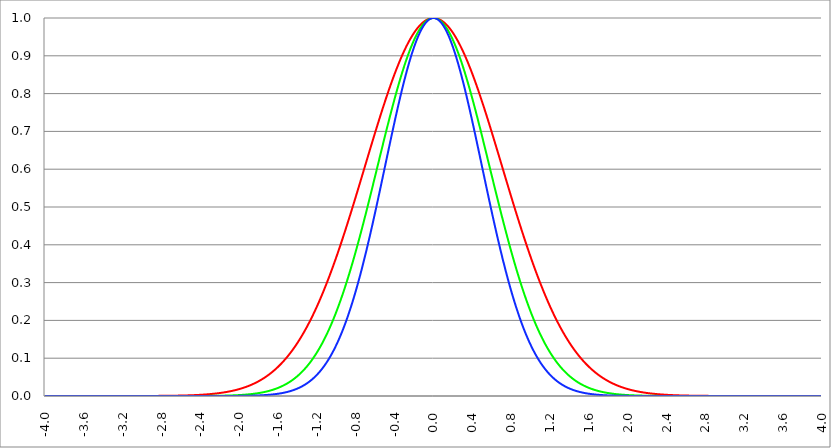
| Category | Series 1 | Series 0 | Series 2 |
|---|---|---|---|
| -4.0 | 0 | 0 | 0 |
| -3.996 | 0 | 0 | 0 |
| -3.992 | 0 | 0 | 0 |
| -3.988 | 0 | 0 | 0 |
| -3.984 | 0 | 0 | 0 |
| -3.98 | 0 | 0 | 0 |
| -3.976 | 0 | 0 | 0 |
| -3.972 | 0 | 0 | 0 |
| -3.968 | 0 | 0 | 0 |
| -3.964 | 0 | 0 | 0 |
| -3.96 | 0 | 0 | 0 |
| -3.956 | 0 | 0 | 0 |
| -3.952 | 0 | 0 | 0 |
| -3.948 | 0 | 0 | 0 |
| -3.944 | 0 | 0 | 0 |
| -3.94 | 0 | 0 | 0 |
| -3.936 | 0 | 0 | 0 |
| -3.932 | 0 | 0 | 0 |
| -3.928 | 0 | 0 | 0 |
| -3.924 | 0 | 0 | 0 |
| -3.92 | 0 | 0 | 0 |
| -3.916 | 0 | 0 | 0 |
| -3.912 | 0 | 0 | 0 |
| -3.908 | 0 | 0 | 0 |
| -3.904 | 0 | 0 | 0 |
| -3.9 | 0 | 0 | 0 |
| -3.896 | 0 | 0 | 0 |
| -3.892 | 0 | 0 | 0 |
| -3.888 | 0 | 0 | 0 |
| -3.884 | 0 | 0 | 0 |
| -3.88 | 0 | 0 | 0 |
| -3.876 | 0 | 0 | 0 |
| -3.872 | 0 | 0 | 0 |
| -3.868 | 0 | 0 | 0 |
| -3.864 | 0 | 0 | 0 |
| -3.86 | 0 | 0 | 0 |
| -3.856 | 0 | 0 | 0 |
| -3.852 | 0 | 0 | 0 |
| -3.848 | 0 | 0 | 0 |
| -3.844 | 0 | 0 | 0 |
| -3.84 | 0 | 0 | 0 |
| -3.836 | 0 | 0 | 0 |
| -3.832 | 0 | 0 | 0 |
| -3.828 | 0 | 0 | 0 |
| -3.824 | 0 | 0 | 0 |
| -3.82 | 0 | 0 | 0 |
| -3.816 | 0 | 0 | 0 |
| -3.812 | 0 | 0 | 0 |
| -3.808 | 0 | 0 | 0 |
| -3.804 | 0 | 0 | 0 |
| -3.8 | 0 | 0 | 0 |
| -3.796 | 0 | 0 | 0 |
| -3.792 | 0 | 0 | 0 |
| -3.788 | 0 | 0 | 0 |
| -3.784 | 0 | 0 | 0 |
| -3.78 | 0 | 0 | 0 |
| -3.776 | 0 | 0 | 0 |
| -3.772 | 0 | 0 | 0 |
| -3.768 | 0 | 0 | 0 |
| -3.764 | 0 | 0 | 0 |
| -3.76 | 0 | 0 | 0 |
| -3.756 | 0 | 0 | 0 |
| -3.752 | 0 | 0 | 0 |
| -3.748 | 0 | 0 | 0 |
| -3.744 | 0 | 0 | 0 |
| -3.74 | 0 | 0 | 0 |
| -3.736 | 0 | 0 | 0 |
| -3.732 | 0 | 0 | 0 |
| -3.728 | 0 | 0 | 0 |
| -3.724 | 0 | 0 | 0 |
| -3.72 | 0 | 0 | 0 |
| -3.716 | 0 | 0 | 0 |
| -3.712 | 0 | 0 | 0 |
| -3.708 | 0 | 0 | 0 |
| -3.704 | 0 | 0 | 0 |
| -3.7 | 0 | 0 | 0 |
| -3.696 | 0 | 0 | 0 |
| -3.692 | 0 | 0 | 0 |
| -3.688 | 0 | 0 | 0 |
| -3.684 | 0 | 0 | 0 |
| -3.68 | 0 | 0 | 0 |
| -3.676 | 0 | 0 | 0 |
| -3.672 | 0 | 0 | 0 |
| -3.668 | 0 | 0 | 0 |
| -3.664 | 0 | 0 | 0 |
| -3.66 | 0 | 0 | 0 |
| -3.656 | 0 | 0 | 0 |
| -3.652 | 0 | 0 | 0 |
| -3.648 | 0 | 0 | 0 |
| -3.644 | 0 | 0 | 0 |
| -3.64 | 0 | 0 | 0 |
| -3.636 | 0 | 0 | 0 |
| -3.632 | 0 | 0 | 0 |
| -3.628 | 0 | 0 | 0 |
| -3.624 | 0 | 0 | 0 |
| -3.62 | 0 | 0 | 0 |
| -3.616 | 0 | 0 | 0 |
| -3.612 | 0 | 0 | 0 |
| -3.608 | 0 | 0 | 0 |
| -3.604 | 0 | 0 | 0 |
| -3.6 | 0 | 0 | 0 |
| -3.596 | 0 | 0 | 0 |
| -3.592 | 0 | 0 | 0 |
| -3.588 | 0 | 0 | 0 |
| -3.584 | 0 | 0 | 0 |
| -3.58 | 0 | 0 | 0 |
| -3.576 | 0 | 0 | 0 |
| -3.572 | 0 | 0 | 0 |
| -3.568 | 0 | 0 | 0 |
| -3.564 | 0 | 0 | 0 |
| -3.56 | 0 | 0 | 0 |
| -3.556 | 0 | 0 | 0 |
| -3.552 | 0 | 0 | 0 |
| -3.548 | 0 | 0 | 0 |
| -3.544 | 0 | 0 | 0 |
| -3.54 | 0 | 0 | 0 |
| -3.536 | 0 | 0 | 0 |
| -3.532 | 0 | 0 | 0 |
| -3.528 | 0 | 0 | 0 |
| -3.524 | 0 | 0 | 0 |
| -3.52 | 0 | 0 | 0 |
| -3.516 | 0 | 0 | 0 |
| -3.512 | 0 | 0 | 0 |
| -3.508 | 0 | 0 | 0 |
| -3.504 | 0 | 0 | 0 |
| -3.5 | 0 | 0 | 0 |
| -3.496 | 0 | 0 | 0 |
| -3.492 | 0 | 0 | 0 |
| -3.488 | 0 | 0 | 0 |
| -3.484 | 0 | 0 | 0 |
| -3.48 | 0 | 0 | 0 |
| -3.476 | 0 | 0 | 0 |
| -3.472 | 0 | 0 | 0 |
| -3.467999999999999 | 0 | 0 | 0 |
| -3.463999999999999 | 0 | 0 | 0 |
| -3.459999999999999 | 0 | 0 | 0 |
| -3.455999999999999 | 0 | 0 | 0 |
| -3.451999999999999 | 0 | 0 | 0 |
| -3.447999999999999 | 0 | 0 | 0 |
| -3.443999999999999 | 0 | 0 | 0 |
| -3.439999999999999 | 0 | 0 | 0 |
| -3.435999999999999 | 0 | 0 | 0 |
| -3.431999999999999 | 0 | 0 | 0 |
| -3.427999999999999 | 0 | 0 | 0 |
| -3.423999999999999 | 0 | 0 | 0 |
| -3.419999999999999 | 0 | 0 | 0 |
| -3.415999999999999 | 0 | 0 | 0 |
| -3.411999999999999 | 0 | 0 | 0 |
| -3.407999999999999 | 0 | 0 | 0 |
| -3.403999999999999 | 0 | 0 | 0 |
| -3.399999999999999 | 0 | 0 | 0 |
| -3.395999999999999 | 0 | 0 | 0 |
| -3.391999999999999 | 0 | 0 | 0 |
| -3.387999999999999 | 0 | 0 | 0 |
| -3.383999999999999 | 0 | 0 | 0 |
| -3.379999999999999 | 0 | 0 | 0 |
| -3.375999999999999 | 0 | 0 | 0 |
| -3.371999999999999 | 0 | 0 | 0 |
| -3.367999999999999 | 0 | 0 | 0 |
| -3.363999999999999 | 0 | 0 | 0 |
| -3.359999999999999 | 0 | 0 | 0 |
| -3.355999999999999 | 0 | 0 | 0 |
| -3.351999999999999 | 0 | 0 | 0 |
| -3.347999999999999 | 0 | 0 | 0 |
| -3.343999999999999 | 0 | 0 | 0 |
| -3.339999999999999 | 0 | 0 | 0 |
| -3.335999999999999 | 0 | 0 | 0 |
| -3.331999999999999 | 0 | 0 | 0 |
| -3.327999999999999 | 0 | 0 | 0 |
| -3.323999999999999 | 0 | 0 | 0 |
| -3.319999999999999 | 0 | 0 | 0 |
| -3.315999999999999 | 0 | 0 | 0 |
| -3.311999999999999 | 0 | 0 | 0 |
| -3.307999999999999 | 0 | 0 | 0 |
| -3.303999999999999 | 0 | 0 | 0 |
| -3.299999999999999 | 0 | 0 | 0 |
| -3.295999999999999 | 0 | 0 | 0 |
| -3.291999999999999 | 0 | 0 | 0 |
| -3.288 | 0 | 0 | 0 |
| -3.284 | 0 | 0 | 0 |
| -3.279999999999999 | 0 | 0 | 0 |
| -3.275999999999999 | 0 | 0 | 0 |
| -3.271999999999999 | 0 | 0 | 0 |
| -3.268 | 0 | 0 | 0 |
| -3.264 | 0 | 0 | 0 |
| -3.259999999999999 | 0 | 0 | 0 |
| -3.255999999999999 | 0 | 0 | 0 |
| -3.251999999999999 | 0 | 0 | 0 |
| -3.248 | 0 | 0 | 0 |
| -3.244 | 0 | 0 | 0 |
| -3.239999999999999 | 0 | 0 | 0 |
| -3.235999999999999 | 0 | 0 | 0 |
| -3.231999999999999 | 0 | 0 | 0 |
| -3.228 | 0 | 0 | 0 |
| -3.224 | 0 | 0 | 0 |
| -3.219999999999999 | 0 | 0 | 0 |
| -3.215999999999999 | 0 | 0 | 0 |
| -3.211999999999999 | 0 | 0 | 0 |
| -3.208 | 0 | 0 | 0 |
| -3.204 | 0 | 0 | 0 |
| -3.199999999999999 | 0 | 0 | 0 |
| -3.195999999999999 | 0 | 0 | 0 |
| -3.191999999999999 | 0 | 0 | 0 |
| -3.188 | 0 | 0 | 0 |
| -3.184 | 0 | 0 | 0 |
| -3.179999999999999 | 0 | 0 | 0 |
| -3.175999999999999 | 0 | 0 | 0 |
| -3.171999999999999 | 0 | 0 | 0 |
| -3.168 | 0 | 0 | 0 |
| -3.164 | 0 | 0 | 0 |
| -3.159999999999999 | 0 | 0 | 0 |
| -3.155999999999999 | 0 | 0 | 0 |
| -3.151999999999999 | 0 | 0 | 0 |
| -3.148 | 0 | 0 | 0 |
| -3.144 | 0 | 0 | 0 |
| -3.139999999999999 | 0 | 0 | 0 |
| -3.135999999999999 | 0 | 0 | 0 |
| -3.131999999999999 | 0 | 0 | 0 |
| -3.128 | 0 | 0 | 0 |
| -3.124 | 0 | 0 | 0 |
| -3.119999999999999 | 0 | 0 | 0 |
| -3.115999999999999 | 0 | 0 | 0 |
| -3.111999999999999 | 0 | 0 | 0 |
| -3.108 | 0 | 0 | 0 |
| -3.104 | 0 | 0 | 0 |
| -3.099999999999999 | 0 | 0 | 0 |
| -3.095999999999999 | 0 | 0 | 0 |
| -3.091999999999999 | 0 | 0 | 0 |
| -3.088 | 0 | 0 | 0 |
| -3.084 | 0 | 0 | 0 |
| -3.079999999999999 | 0 | 0 | 0 |
| -3.075999999999999 | 0 | 0 | 0 |
| -3.071999999999999 | 0 | 0 | 0 |
| -3.068 | 0 | 0 | 0 |
| -3.064 | 0 | 0 | 0 |
| -3.059999999999999 | 0 | 0 | 0 |
| -3.055999999999999 | 0 | 0 | 0 |
| -3.051999999999999 | 0 | 0 | 0 |
| -3.048 | 0 | 0 | 0 |
| -3.044 | 0 | 0 | 0 |
| -3.039999999999999 | 0 | 0 | 0 |
| -3.035999999999999 | 0 | 0 | 0 |
| -3.031999999999999 | 0 | 0 | 0 |
| -3.028 | 0 | 0 | 0 |
| -3.024 | 0 | 0 | 0 |
| -3.019999999999999 | 0 | 0 | 0 |
| -3.015999999999999 | 0 | 0 | 0 |
| -3.011999999999999 | 0 | 0 | 0 |
| -3.008 | 0 | 0 | 0 |
| -3.004 | 0 | 0 | 0 |
| -2.999999999999999 | 0 | 0 | 0 |
| -2.995999999999999 | 0 | 0 | 0 |
| -2.991999999999999 | 0 | 0 | 0 |
| -2.988 | 0 | 0 | 0 |
| -2.984 | 0 | 0 | 0 |
| -2.979999999999999 | 0 | 0 | 0 |
| -2.975999999999999 | 0 | 0 | 0 |
| -2.971999999999999 | 0 | 0 | 0 |
| -2.968 | 0 | 0 | 0 |
| -2.964 | 0 | 0 | 0 |
| -2.959999999999999 | 0 | 0 | 0 |
| -2.955999999999999 | 0 | 0 | 0 |
| -2.951999999999999 | 0 | 0 | 0 |
| -2.948 | 0 | 0 | 0 |
| -2.944 | 0 | 0 | 0 |
| -2.939999999999999 | 0 | 0 | 0 |
| -2.935999999999999 | 0 | 0 | 0 |
| -2.931999999999999 | 0 | 0 | 0 |
| -2.928 | 0 | 0 | 0 |
| -2.924 | 0 | 0 | 0 |
| -2.919999999999999 | 0 | 0 | 0 |
| -2.915999999999999 | 0 | 0 | 0 |
| -2.911999999999999 | 0 | 0 | 0 |
| -2.908 | 0 | 0 | 0 |
| -2.904 | 0 | 0 | 0 |
| -2.899999999999999 | 0 | 0 | 0 |
| -2.895999999999999 | 0 | 0 | 0 |
| -2.891999999999999 | 0 | 0 | 0 |
| -2.887999999999999 | 0 | 0 | 0 |
| -2.883999999999999 | 0 | 0 | 0 |
| -2.879999999999999 | 0 | 0 | 0 |
| -2.875999999999999 | 0 | 0 | 0 |
| -2.871999999999999 | 0 | 0 | 0 |
| -2.867999999999999 | 0 | 0 | 0 |
| -2.863999999999999 | 0 | 0 | 0 |
| -2.859999999999999 | 0 | 0 | 0 |
| -2.855999999999999 | 0 | 0 | 0 |
| -2.851999999999999 | 0 | 0 | 0 |
| -2.847999999999999 | 0 | 0 | 0 |
| -2.843999999999999 | 0 | 0 | 0 |
| -2.839999999999999 | 0 | 0 | 0 |
| -2.835999999999999 | 0 | 0 | 0 |
| -2.831999999999999 | 0 | 0 | 0 |
| -2.827999999999999 | 0 | 0 | 0 |
| -2.823999999999999 | 0 | 0 | 0 |
| -2.819999999999999 | 0 | 0 | 0 |
| -2.815999999999999 | 0 | 0 | 0 |
| -2.811999999999999 | 0 | 0 | 0 |
| -2.807999999999999 | 0 | 0 | 0 |
| -2.803999999999999 | 0 | 0 | 0 |
| -2.799999999999999 | 0 | 0 | 0 |
| -2.795999999999999 | 0 | 0 | 0 |
| -2.791999999999999 | 0 | 0 | 0 |
| -2.787999999999999 | 0 | 0 | 0 |
| -2.783999999999999 | 0 | 0 | 0 |
| -2.779999999999999 | 0 | 0 | 0 |
| -2.775999999999999 | 0 | 0 | 0 |
| -2.771999999999999 | 0 | 0 | 0 |
| -2.767999999999999 | 0 | 0 | 0 |
| -2.763999999999999 | 0 | 0 | 0 |
| -2.759999999999999 | 0 | 0 | 0 |
| -2.755999999999999 | 0.001 | 0 | 0 |
| -2.751999999999999 | 0.001 | 0 | 0 |
| -2.747999999999999 | 0.001 | 0 | 0 |
| -2.743999999999999 | 0.001 | 0 | 0 |
| -2.739999999999999 | 0.001 | 0 | 0 |
| -2.735999999999999 | 0.001 | 0 | 0 |
| -2.731999999999999 | 0.001 | 0 | 0 |
| -2.727999999999999 | 0.001 | 0 | 0 |
| -2.723999999999999 | 0.001 | 0 | 0 |
| -2.719999999999999 | 0.001 | 0 | 0 |
| -2.715999999999999 | 0.001 | 0 | 0 |
| -2.711999999999999 | 0.001 | 0 | 0 |
| -2.707999999999999 | 0.001 | 0 | 0 |
| -2.703999999999999 | 0.001 | 0 | 0 |
| -2.699999999999999 | 0.001 | 0 | 0 |
| -2.695999999999999 | 0.001 | 0 | 0 |
| -2.691999999999999 | 0.001 | 0 | 0 |
| -2.687999999999999 | 0.001 | 0 | 0 |
| -2.683999999999999 | 0.001 | 0 | 0 |
| -2.679999999999999 | 0.001 | 0 | 0 |
| -2.675999999999999 | 0.001 | 0 | 0 |
| -2.671999999999999 | 0.001 | 0 | 0 |
| -2.667999999999999 | 0.001 | 0 | 0 |
| -2.663999999999999 | 0.001 | 0 | 0 |
| -2.659999999999999 | 0.001 | 0 | 0 |
| -2.655999999999999 | 0.001 | 0 | 0 |
| -2.651999999999999 | 0.001 | 0 | 0 |
| -2.647999999999999 | 0.001 | 0 | 0 |
| -2.643999999999999 | 0.001 | 0 | 0 |
| -2.639999999999999 | 0.001 | 0 | 0 |
| -2.635999999999999 | 0.001 | 0 | 0 |
| -2.631999999999999 | 0.001 | 0 | 0 |
| -2.627999999999999 | 0.001 | 0 | 0 |
| -2.623999999999999 | 0.001 | 0 | 0 |
| -2.619999999999999 | 0.001 | 0 | 0 |
| -2.615999999999999 | 0.001 | 0 | 0 |
| -2.611999999999999 | 0.001 | 0 | 0 |
| -2.607999999999999 | 0.001 | 0 | 0 |
| -2.603999999999999 | 0.001 | 0 | 0 |
| -2.599999999999999 | 0.001 | 0 | 0 |
| -2.595999999999999 | 0.001 | 0 | 0 |
| -2.591999999999999 | 0.001 | 0 | 0 |
| -2.587999999999999 | 0.001 | 0 | 0 |
| -2.583999999999999 | 0.001 | 0 | 0 |
| -2.579999999999999 | 0.001 | 0 | 0 |
| -2.575999999999999 | 0.001 | 0 | 0 |
| -2.571999999999999 | 0.001 | 0 | 0 |
| -2.567999999999999 | 0.001 | 0 | 0 |
| -2.563999999999999 | 0.001 | 0 | 0 |
| -2.559999999999999 | 0.001 | 0 | 0 |
| -2.555999999999999 | 0.001 | 0 | 0 |
| -2.551999999999999 | 0.001 | 0 | 0 |
| -2.547999999999999 | 0.002 | 0 | 0 |
| -2.543999999999999 | 0.002 | 0 | 0 |
| -2.539999999999999 | 0.002 | 0 | 0 |
| -2.535999999999999 | 0.002 | 0 | 0 |
| -2.531999999999999 | 0.002 | 0 | 0 |
| -2.527999999999999 | 0.002 | 0 | 0 |
| -2.523999999999999 | 0.002 | 0 | 0 |
| -2.519999999999999 | 0.002 | 0 | 0 |
| -2.515999999999999 | 0.002 | 0 | 0 |
| -2.511999999999999 | 0.002 | 0 | 0 |
| -2.507999999999999 | 0.002 | 0 | 0 |
| -2.503999999999999 | 0.002 | 0 | 0 |
| -2.499999999999999 | 0.002 | 0 | 0 |
| -2.495999999999999 | 0.002 | 0 | 0 |
| -2.491999999999999 | 0.002 | 0 | 0 |
| -2.487999999999999 | 0.002 | 0 | 0 |
| -2.483999999999999 | 0.002 | 0 | 0 |
| -2.479999999999999 | 0.002 | 0 | 0 |
| -2.475999999999999 | 0.002 | 0 | 0 |
| -2.471999999999999 | 0.002 | 0 | 0 |
| -2.467999999999999 | 0.002 | 0 | 0 |
| -2.463999999999999 | 0.002 | 0 | 0 |
| -2.459999999999999 | 0.002 | 0 | 0 |
| -2.455999999999999 | 0.002 | 0 | 0 |
| -2.451999999999999 | 0.002 | 0 | 0 |
| -2.447999999999999 | 0.002 | 0 | 0 |
| -2.443999999999999 | 0.003 | 0 | 0 |
| -2.439999999999999 | 0.003 | 0 | 0 |
| -2.435999999999999 | 0.003 | 0 | 0 |
| -2.431999999999999 | 0.003 | 0 | 0 |
| -2.427999999999999 | 0.003 | 0 | 0 |
| -2.423999999999999 | 0.003 | 0 | 0 |
| -2.419999999999999 | 0.003 | 0 | 0 |
| -2.415999999999999 | 0.003 | 0 | 0 |
| -2.411999999999999 | 0.003 | 0 | 0 |
| -2.407999999999999 | 0.003 | 0 | 0 |
| -2.403999999999999 | 0.003 | 0 | 0 |
| -2.399999999999999 | 0.003 | 0 | 0 |
| -2.395999999999999 | 0.003 | 0 | 0 |
| -2.391999999999999 | 0.003 | 0 | 0 |
| -2.387999999999999 | 0.003 | 0 | 0 |
| -2.383999999999999 | 0.003 | 0 | 0 |
| -2.379999999999999 | 0.003 | 0 | 0 |
| -2.375999999999999 | 0.004 | 0 | 0 |
| -2.371999999999999 | 0.004 | 0 | 0 |
| -2.367999999999998 | 0.004 | 0 | 0 |
| -2.363999999999998 | 0.004 | 0 | 0 |
| -2.359999999999998 | 0.004 | 0 | 0 |
| -2.355999999999998 | 0.004 | 0 | 0 |
| -2.351999999999998 | 0.004 | 0 | 0 |
| -2.347999999999998 | 0.004 | 0 | 0 |
| -2.343999999999998 | 0.004 | 0 | 0 |
| -2.339999999999998 | 0.004 | 0 | 0 |
| -2.335999999999998 | 0.004 | 0 | 0 |
| -2.331999999999998 | 0.004 | 0 | 0 |
| -2.327999999999998 | 0.004 | 0 | 0 |
| -2.323999999999998 | 0.005 | 0 | 0 |
| -2.319999999999998 | 0.005 | 0 | 0 |
| -2.315999999999998 | 0.005 | 0 | 0 |
| -2.311999999999998 | 0.005 | 0 | 0 |
| -2.307999999999998 | 0.005 | 0 | 0 |
| -2.303999999999998 | 0.005 | 0 | 0 |
| -2.299999999999998 | 0.005 | 0 | 0 |
| -2.295999999999998 | 0.005 | 0 | 0 |
| -2.291999999999998 | 0.005 | 0 | 0 |
| -2.287999999999998 | 0.005 | 0 | 0 |
| -2.283999999999998 | 0.005 | 0 | 0 |
| -2.279999999999998 | 0.006 | 0 | 0 |
| -2.275999999999998 | 0.006 | 0 | 0 |
| -2.271999999999998 | 0.006 | 0 | 0 |
| -2.267999999999998 | 0.006 | 0 | 0 |
| -2.263999999999998 | 0.006 | 0 | 0 |
| -2.259999999999998 | 0.006 | 0 | 0 |
| -2.255999999999998 | 0.006 | 0 | 0 |
| -2.251999999999998 | 0.006 | 0 | 0 |
| -2.247999999999998 | 0.006 | 0.001 | 0 |
| -2.243999999999998 | 0.007 | 0.001 | 0 |
| -2.239999999999998 | 0.007 | 0.001 | 0 |
| -2.235999999999998 | 0.007 | 0.001 | 0 |
| -2.231999999999998 | 0.007 | 0.001 | 0 |
| -2.227999999999998 | 0.007 | 0.001 | 0 |
| -2.223999999999998 | 0.007 | 0.001 | 0 |
| -2.219999999999998 | 0.007 | 0.001 | 0 |
| -2.215999999999998 | 0.007 | 0.001 | 0 |
| -2.211999999999998 | 0.007 | 0.001 | 0 |
| -2.207999999999998 | 0.008 | 0.001 | 0 |
| -2.203999999999998 | 0.008 | 0.001 | 0 |
| -2.199999999999998 | 0.008 | 0.001 | 0 |
| -2.195999999999998 | 0.008 | 0.001 | 0 |
| -2.191999999999998 | 0.008 | 0.001 | 0 |
| -2.187999999999998 | 0.008 | 0.001 | 0 |
| -2.183999999999998 | 0.008 | 0.001 | 0 |
| -2.179999999999998 | 0.009 | 0.001 | 0 |
| -2.175999999999998 | 0.009 | 0.001 | 0 |
| -2.171999999999998 | 0.009 | 0.001 | 0 |
| -2.167999999999998 | 0.009 | 0.001 | 0 |
| -2.163999999999998 | 0.009 | 0.001 | 0 |
| -2.159999999999998 | 0.009 | 0.001 | 0 |
| -2.155999999999998 | 0.01 | 0.001 | 0 |
| -2.151999999999998 | 0.01 | 0.001 | 0 |
| -2.147999999999998 | 0.01 | 0.001 | 0 |
| -2.143999999999998 | 0.01 | 0.001 | 0 |
| -2.139999999999998 | 0.01 | 0.001 | 0 |
| -2.135999999999998 | 0.01 | 0.001 | 0 |
| -2.131999999999998 | 0.011 | 0.001 | 0 |
| -2.127999999999998 | 0.011 | 0.001 | 0 |
| -2.123999999999998 | 0.011 | 0.001 | 0 |
| -2.119999999999998 | 0.011 | 0.001 | 0 |
| -2.115999999999998 | 0.011 | 0.001 | 0 |
| -2.111999999999998 | 0.012 | 0.001 | 0 |
| -2.107999999999998 | 0.012 | 0.001 | 0 |
| -2.103999999999998 | 0.012 | 0.001 | 0 |
| -2.099999999999998 | 0.012 | 0.001 | 0 |
| -2.095999999999998 | 0.012 | 0.001 | 0 |
| -2.091999999999998 | 0.013 | 0.001 | 0 |
| -2.087999999999998 | 0.013 | 0.001 | 0 |
| -2.083999999999998 | 0.013 | 0.001 | 0 |
| -2.079999999999998 | 0.013 | 0.002 | 0 |
| -2.075999999999998 | 0.013 | 0.002 | 0 |
| -2.071999999999998 | 0.014 | 0.002 | 0 |
| -2.067999999999998 | 0.014 | 0.002 | 0 |
| -2.063999999999998 | 0.014 | 0.002 | 0 |
| -2.059999999999998 | 0.014 | 0.002 | 0 |
| -2.055999999999998 | 0.015 | 0.002 | 0 |
| -2.051999999999998 | 0.015 | 0.002 | 0 |
| -2.047999999999998 | 0.015 | 0.002 | 0 |
| -2.043999999999998 | 0.015 | 0.002 | 0 |
| -2.039999999999998 | 0.016 | 0.002 | 0 |
| -2.035999999999998 | 0.016 | 0.002 | 0 |
| -2.031999999999998 | 0.016 | 0.002 | 0 |
| -2.027999999999998 | 0.016 | 0.002 | 0 |
| -2.023999999999998 | 0.017 | 0.002 | 0 |
| -2.019999999999998 | 0.017 | 0.002 | 0 |
| -2.015999999999998 | 0.017 | 0.002 | 0 |
| -2.011999999999998 | 0.017 | 0.002 | 0 |
| -2.007999999999998 | 0.018 | 0.002 | 0 |
| -2.003999999999998 | 0.018 | 0.002 | 0 |
| -1.999999999999998 | 0.018 | 0.002 | 0 |
| -1.995999999999998 | 0.019 | 0.003 | 0 |
| -1.991999999999998 | 0.019 | 0.003 | 0 |
| -1.987999999999998 | 0.019 | 0.003 | 0 |
| -1.983999999999998 | 0.02 | 0.003 | 0 |
| -1.979999999999998 | 0.02 | 0.003 | 0 |
| -1.975999999999998 | 0.02 | 0.003 | 0 |
| -1.971999999999998 | 0.02 | 0.003 | 0 |
| -1.967999999999998 | 0.021 | 0.003 | 0 |
| -1.963999999999998 | 0.021 | 0.003 | 0 |
| -1.959999999999998 | 0.021 | 0.003 | 0 |
| -1.955999999999998 | 0.022 | 0.003 | 0 |
| -1.951999999999998 | 0.022 | 0.003 | 0 |
| -1.947999999999998 | 0.022 | 0.003 | 0.001 |
| -1.943999999999998 | 0.023 | 0.003 | 0.001 |
| -1.939999999999998 | 0.023 | 0.004 | 0.001 |
| -1.935999999999998 | 0.024 | 0.004 | 0.001 |
| -1.931999999999998 | 0.024 | 0.004 | 0.001 |
| -1.927999999999998 | 0.024 | 0.004 | 0.001 |
| -1.923999999999998 | 0.025 | 0.004 | 0.001 |
| -1.919999999999998 | 0.025 | 0.004 | 0.001 |
| -1.915999999999998 | 0.025 | 0.004 | 0.001 |
| -1.911999999999998 | 0.026 | 0.004 | 0.001 |
| -1.907999999999998 | 0.026 | 0.004 | 0.001 |
| -1.903999999999998 | 0.027 | 0.004 | 0.001 |
| -1.899999999999998 | 0.027 | 0.004 | 0.001 |
| -1.895999999999998 | 0.027 | 0.005 | 0.001 |
| -1.891999999999998 | 0.028 | 0.005 | 0.001 |
| -1.887999999999998 | 0.028 | 0.005 | 0.001 |
| -1.883999999999998 | 0.029 | 0.005 | 0.001 |
| -1.879999999999998 | 0.029 | 0.005 | 0.001 |
| -1.875999999999998 | 0.03 | 0.005 | 0.001 |
| -1.871999999999998 | 0.03 | 0.005 | 0.001 |
| -1.867999999999998 | 0.031 | 0.005 | 0.001 |
| -1.863999999999998 | 0.031 | 0.005 | 0.001 |
| -1.859999999999998 | 0.031 | 0.006 | 0.001 |
| -1.855999999999998 | 0.032 | 0.006 | 0.001 |
| -1.851999999999998 | 0.032 | 0.006 | 0.001 |
| -1.847999999999998 | 0.033 | 0.006 | 0.001 |
| -1.843999999999998 | 0.033 | 0.006 | 0.001 |
| -1.839999999999998 | 0.034 | 0.006 | 0.001 |
| -1.835999999999998 | 0.034 | 0.006 | 0.001 |
| -1.831999999999998 | 0.035 | 0.007 | 0.001 |
| -1.827999999999998 | 0.035 | 0.007 | 0.001 |
| -1.823999999999998 | 0.036 | 0.007 | 0.001 |
| -1.819999999999998 | 0.036 | 0.007 | 0.001 |
| -1.815999999999998 | 0.037 | 0.007 | 0.001 |
| -1.811999999999998 | 0.038 | 0.007 | 0.001 |
| -1.807999999999998 | 0.038 | 0.007 | 0.001 |
| -1.803999999999998 | 0.039 | 0.008 | 0.001 |
| -1.799999999999998 | 0.039 | 0.008 | 0.002 |
| -1.795999999999998 | 0.04 | 0.008 | 0.002 |
| -1.791999999999998 | 0.04 | 0.008 | 0.002 |
| -1.787999999999998 | 0.041 | 0.008 | 0.002 |
| -1.783999999999998 | 0.041 | 0.008 | 0.002 |
| -1.779999999999998 | 0.042 | 0.009 | 0.002 |
| -1.775999999999998 | 0.043 | 0.009 | 0.002 |
| -1.771999999999998 | 0.043 | 0.009 | 0.002 |
| -1.767999999999998 | 0.044 | 0.009 | 0.002 |
| -1.763999999999998 | 0.045 | 0.009 | 0.002 |
| -1.759999999999998 | 0.045 | 0.01 | 0.002 |
| -1.755999999999998 | 0.046 | 0.01 | 0.002 |
| -1.751999999999998 | 0.046 | 0.01 | 0.002 |
| -1.747999999999998 | 0.047 | 0.01 | 0.002 |
| -1.743999999999998 | 0.048 | 0.01 | 0.002 |
| -1.739999999999998 | 0.048 | 0.011 | 0.002 |
| -1.735999999999998 | 0.049 | 0.011 | 0.002 |
| -1.731999999999998 | 0.05 | 0.011 | 0.002 |
| -1.727999999999998 | 0.05 | 0.011 | 0.003 |
| -1.723999999999998 | 0.051 | 0.012 | 0.003 |
| -1.719999999999998 | 0.052 | 0.012 | 0.003 |
| -1.715999999999998 | 0.053 | 0.012 | 0.003 |
| -1.711999999999998 | 0.053 | 0.012 | 0.003 |
| -1.707999999999998 | 0.054 | 0.013 | 0.003 |
| -1.703999999999998 | 0.055 | 0.013 | 0.003 |
| -1.699999999999998 | 0.056 | 0.013 | 0.003 |
| -1.695999999999998 | 0.056 | 0.013 | 0.003 |
| -1.691999999999998 | 0.057 | 0.014 | 0.003 |
| -1.687999999999998 | 0.058 | 0.014 | 0.003 |
| -1.683999999999998 | 0.059 | 0.014 | 0.003 |
| -1.679999999999998 | 0.059 | 0.015 | 0.004 |
| -1.675999999999998 | 0.06 | 0.015 | 0.004 |
| -1.671999999999998 | 0.061 | 0.015 | 0.004 |
| -1.667999999999998 | 0.062 | 0.015 | 0.004 |
| -1.663999999999998 | 0.063 | 0.016 | 0.004 |
| -1.659999999999998 | 0.064 | 0.016 | 0.004 |
| -1.655999999999998 | 0.064 | 0.016 | 0.004 |
| -1.651999999999998 | 0.065 | 0.017 | 0.004 |
| -1.647999999999998 | 0.066 | 0.017 | 0.004 |
| -1.643999999999998 | 0.067 | 0.017 | 0.004 |
| -1.639999999999998 | 0.068 | 0.018 | 0.005 |
| -1.635999999999998 | 0.069 | 0.018 | 0.005 |
| -1.631999999999998 | 0.07 | 0.018 | 0.005 |
| -1.627999999999998 | 0.071 | 0.019 | 0.005 |
| -1.623999999999998 | 0.072 | 0.019 | 0.005 |
| -1.619999999999998 | 0.072 | 0.02 | 0.005 |
| -1.615999999999998 | 0.073 | 0.02 | 0.005 |
| -1.611999999999998 | 0.074 | 0.02 | 0.006 |
| -1.607999999999998 | 0.075 | 0.021 | 0.006 |
| -1.603999999999998 | 0.076 | 0.021 | 0.006 |
| -1.599999999999998 | 0.077 | 0.021 | 0.006 |
| -1.595999999999998 | 0.078 | 0.022 | 0.006 |
| -1.591999999999998 | 0.079 | 0.022 | 0.006 |
| -1.587999999999998 | 0.08 | 0.023 | 0.006 |
| -1.583999999999998 | 0.081 | 0.023 | 0.007 |
| -1.579999999999998 | 0.082 | 0.024 | 0.007 |
| -1.575999999999998 | 0.083 | 0.024 | 0.007 |
| -1.571999999999998 | 0.084 | 0.025 | 0.007 |
| -1.567999999999998 | 0.086 | 0.025 | 0.007 |
| -1.563999999999998 | 0.087 | 0.025 | 0.008 |
| -1.559999999999998 | 0.088 | 0.026 | 0.008 |
| -1.555999999999998 | 0.089 | 0.026 | 0.008 |
| -1.551999999999998 | 0.09 | 0.027 | 0.008 |
| -1.547999999999998 | 0.091 | 0.027 | 0.008 |
| -1.543999999999998 | 0.092 | 0.028 | 0.008 |
| -1.539999999999998 | 0.093 | 0.029 | 0.009 |
| -1.535999999999998 | 0.094 | 0.029 | 0.009 |
| -1.531999999999998 | 0.096 | 0.03 | 0.009 |
| -1.527999999999998 | 0.097 | 0.03 | 0.009 |
| -1.523999999999998 | 0.098 | 0.031 | 0.01 |
| -1.519999999999998 | 0.099 | 0.031 | 0.01 |
| -1.515999999999998 | 0.1 | 0.032 | 0.01 |
| -1.511999999999998 | 0.102 | 0.032 | 0.01 |
| -1.507999999999998 | 0.103 | 0.033 | 0.011 |
| -1.503999999999998 | 0.104 | 0.034 | 0.011 |
| -1.499999999999998 | 0.105 | 0.034 | 0.011 |
| -1.495999999999998 | 0.107 | 0.035 | 0.011 |
| -1.491999999999998 | 0.108 | 0.035 | 0.012 |
| -1.487999999999998 | 0.109 | 0.036 | 0.012 |
| -1.483999999999998 | 0.111 | 0.037 | 0.012 |
| -1.479999999999998 | 0.112 | 0.037 | 0.013 |
| -1.475999999999998 | 0.113 | 0.038 | 0.013 |
| -1.471999999999998 | 0.115 | 0.039 | 0.013 |
| -1.467999999999998 | 0.116 | 0.039 | 0.013 |
| -1.463999999999998 | 0.117 | 0.04 | 0.014 |
| -1.459999999999998 | 0.119 | 0.041 | 0.014 |
| -1.455999999999998 | 0.12 | 0.042 | 0.014 |
| -1.451999999999998 | 0.121 | 0.042 | 0.015 |
| -1.447999999999998 | 0.123 | 0.043 | 0.015 |
| -1.443999999999998 | 0.124 | 0.044 | 0.015 |
| -1.439999999999998 | 0.126 | 0.045 | 0.016 |
| -1.435999999999998 | 0.127 | 0.045 | 0.016 |
| -1.431999999999998 | 0.129 | 0.046 | 0.017 |
| -1.427999999999998 | 0.13 | 0.047 | 0.017 |
| -1.423999999999998 | 0.132 | 0.048 | 0.017 |
| -1.419999999999998 | 0.133 | 0.049 | 0.018 |
| -1.415999999999998 | 0.135 | 0.049 | 0.018 |
| -1.411999999999998 | 0.136 | 0.05 | 0.019 |
| -1.407999999999998 | 0.138 | 0.051 | 0.019 |
| -1.403999999999998 | 0.139 | 0.052 | 0.019 |
| -1.399999999999998 | 0.141 | 0.053 | 0.02 |
| -1.395999999999998 | 0.142 | 0.054 | 0.02 |
| -1.391999999999998 | 0.144 | 0.055 | 0.021 |
| -1.387999999999998 | 0.146 | 0.056 | 0.021 |
| -1.383999999999998 | 0.147 | 0.057 | 0.022 |
| -1.379999999999998 | 0.149 | 0.057 | 0.022 |
| -1.375999999999998 | 0.151 | 0.058 | 0.023 |
| -1.371999999999998 | 0.152 | 0.059 | 0.023 |
| -1.367999999999998 | 0.154 | 0.06 | 0.024 |
| -1.363999999999998 | 0.156 | 0.061 | 0.024 |
| -1.359999999999998 | 0.157 | 0.062 | 0.025 |
| -1.355999999999998 | 0.159 | 0.063 | 0.025 |
| -1.351999999999998 | 0.161 | 0.064 | 0.026 |
| -1.347999999999998 | 0.162 | 0.066 | 0.026 |
| -1.343999999999998 | 0.164 | 0.067 | 0.027 |
| -1.339999999999998 | 0.166 | 0.068 | 0.028 |
| -1.335999999999998 | 0.168 | 0.069 | 0.028 |
| -1.331999999999998 | 0.17 | 0.07 | 0.029 |
| -1.327999999999998 | 0.171 | 0.071 | 0.029 |
| -1.323999999999998 | 0.173 | 0.072 | 0.03 |
| -1.319999999999998 | 0.175 | 0.073 | 0.031 |
| -1.315999999999998 | 0.177 | 0.074 | 0.031 |
| -1.311999999999998 | 0.179 | 0.076 | 0.032 |
| -1.307999999999998 | 0.181 | 0.077 | 0.033 |
| -1.303999999999998 | 0.183 | 0.078 | 0.033 |
| -1.299999999999998 | 0.185 | 0.079 | 0.034 |
| -1.295999999999998 | 0.186 | 0.081 | 0.035 |
| -1.291999999999998 | 0.188 | 0.082 | 0.035 |
| -1.287999999999998 | 0.19 | 0.083 | 0.036 |
| -1.283999999999998 | 0.192 | 0.084 | 0.037 |
| -1.279999999999998 | 0.194 | 0.086 | 0.038 |
| -1.275999999999998 | 0.196 | 0.087 | 0.039 |
| -1.271999999999998 | 0.198 | 0.088 | 0.039 |
| -1.267999999999998 | 0.2 | 0.09 | 0.04 |
| -1.263999999999998 | 0.202 | 0.091 | 0.041 |
| -1.259999999999998 | 0.204 | 0.092 | 0.042 |
| -1.255999999999998 | 0.206 | 0.094 | 0.043 |
| -1.251999999999998 | 0.209 | 0.095 | 0.043 |
| -1.247999999999998 | 0.211 | 0.097 | 0.044 |
| -1.243999999999998 | 0.213 | 0.098 | 0.045 |
| -1.239999999999998 | 0.215 | 0.1 | 0.046 |
| -1.235999999999998 | 0.217 | 0.101 | 0.047 |
| -1.231999999999998 | 0.219 | 0.103 | 0.048 |
| -1.227999999999998 | 0.221 | 0.104 | 0.049 |
| -1.223999999999998 | 0.224 | 0.106 | 0.05 |
| -1.219999999999998 | 0.226 | 0.107 | 0.051 |
| -1.215999999999998 | 0.228 | 0.109 | 0.052 |
| -1.211999999999998 | 0.23 | 0.11 | 0.053 |
| -1.207999999999998 | 0.232 | 0.112 | 0.054 |
| -1.203999999999998 | 0.235 | 0.114 | 0.055 |
| -1.199999999999997 | 0.237 | 0.115 | 0.056 |
| -1.195999999999997 | 0.239 | 0.117 | 0.057 |
| -1.191999999999997 | 0.242 | 0.119 | 0.058 |
| -1.187999999999997 | 0.244 | 0.12 | 0.059 |
| -1.183999999999997 | 0.246 | 0.122 | 0.061 |
| -1.179999999999997 | 0.248 | 0.124 | 0.062 |
| -1.175999999999997 | 0.251 | 0.126 | 0.063 |
| -1.171999999999997 | 0.253 | 0.127 | 0.064 |
| -1.167999999999997 | 0.256 | 0.129 | 0.065 |
| -1.163999999999997 | 0.258 | 0.131 | 0.067 |
| -1.159999999999997 | 0.26 | 0.133 | 0.068 |
| -1.155999999999997 | 0.263 | 0.135 | 0.069 |
| -1.151999999999997 | 0.265 | 0.137 | 0.07 |
| -1.147999999999997 | 0.268 | 0.139 | 0.072 |
| -1.143999999999997 | 0.27 | 0.14 | 0.073 |
| -1.139999999999997 | 0.273 | 0.142 | 0.074 |
| -1.135999999999997 | 0.275 | 0.144 | 0.076 |
| -1.131999999999997 | 0.278 | 0.146 | 0.077 |
| -1.127999999999997 | 0.28 | 0.148 | 0.078 |
| -1.123999999999997 | 0.283 | 0.15 | 0.08 |
| -1.119999999999997 | 0.285 | 0.152 | 0.081 |
| -1.115999999999997 | 0.288 | 0.154 | 0.083 |
| -1.111999999999997 | 0.29 | 0.156 | 0.084 |
| -1.107999999999997 | 0.293 | 0.159 | 0.086 |
| -1.103999999999997 | 0.296 | 0.161 | 0.087 |
| -1.099999999999997 | 0.298 | 0.163 | 0.089 |
| -1.095999999999997 | 0.301 | 0.165 | 0.09 |
| -1.091999999999997 | 0.303 | 0.167 | 0.092 |
| -1.087999999999997 | 0.306 | 0.169 | 0.094 |
| -1.083999999999997 | 0.309 | 0.172 | 0.095 |
| -1.079999999999997 | 0.311 | 0.174 | 0.097 |
| -1.075999999999997 | 0.314 | 0.176 | 0.099 |
| -1.071999999999997 | 0.317 | 0.178 | 0.1 |
| -1.067999999999997 | 0.32 | 0.181 | 0.102 |
| -1.063999999999997 | 0.322 | 0.183 | 0.104 |
| -1.059999999999997 | 0.325 | 0.185 | 0.106 |
| -1.055999999999997 | 0.328 | 0.188 | 0.107 |
| -1.051999999999997 | 0.331 | 0.19 | 0.109 |
| -1.047999999999997 | 0.333 | 0.193 | 0.111 |
| -1.043999999999997 | 0.336 | 0.195 | 0.113 |
| -1.039999999999997 | 0.339 | 0.197 | 0.115 |
| -1.035999999999997 | 0.342 | 0.2 | 0.117 |
| -1.031999999999997 | 0.345 | 0.202 | 0.119 |
| -1.027999999999997 | 0.348 | 0.205 | 0.121 |
| -1.023999999999997 | 0.35 | 0.207 | 0.123 |
| -1.019999999999997 | 0.353 | 0.21 | 0.125 |
| -1.015999999999997 | 0.356 | 0.213 | 0.127 |
| -1.011999999999997 | 0.359 | 0.215 | 0.129 |
| -1.007999999999997 | 0.362 | 0.218 | 0.131 |
| -1.003999999999997 | 0.365 | 0.22 | 0.133 |
| -0.999999999999997 | 0.368 | 0.223 | 0.135 |
| -0.995999999999997 | 0.371 | 0.226 | 0.138 |
| -0.991999999999997 | 0.374 | 0.229 | 0.14 |
| -0.987999999999997 | 0.377 | 0.231 | 0.142 |
| -0.983999999999997 | 0.38 | 0.234 | 0.144 |
| -0.979999999999997 | 0.383 | 0.237 | 0.146 |
| -0.975999999999997 | 0.386 | 0.24 | 0.149 |
| -0.971999999999997 | 0.389 | 0.242 | 0.151 |
| -0.967999999999997 | 0.392 | 0.245 | 0.154 |
| -0.963999999999997 | 0.395 | 0.248 | 0.156 |
| -0.959999999999997 | 0.398 | 0.251 | 0.158 |
| -0.955999999999997 | 0.401 | 0.254 | 0.161 |
| -0.951999999999997 | 0.404 | 0.257 | 0.163 |
| -0.947999999999997 | 0.407 | 0.26 | 0.166 |
| -0.943999999999997 | 0.41 | 0.263 | 0.168 |
| -0.939999999999997 | 0.413 | 0.266 | 0.171 |
| -0.935999999999997 | 0.416 | 0.269 | 0.173 |
| -0.931999999999997 | 0.42 | 0.272 | 0.176 |
| -0.927999999999997 | 0.423 | 0.275 | 0.179 |
| -0.923999999999997 | 0.426 | 0.278 | 0.181 |
| -0.919999999999997 | 0.429 | 0.281 | 0.184 |
| -0.915999999999997 | 0.432 | 0.284 | 0.187 |
| -0.911999999999997 | 0.435 | 0.287 | 0.189 |
| -0.907999999999997 | 0.438 | 0.29 | 0.192 |
| -0.903999999999997 | 0.442 | 0.294 | 0.195 |
| -0.899999999999997 | 0.445 | 0.297 | 0.198 |
| -0.895999999999997 | 0.448 | 0.3 | 0.201 |
| -0.891999999999997 | 0.451 | 0.303 | 0.204 |
| -0.887999999999997 | 0.455 | 0.306 | 0.207 |
| -0.883999999999997 | 0.458 | 0.31 | 0.21 |
| -0.879999999999997 | 0.461 | 0.313 | 0.213 |
| -0.875999999999997 | 0.464 | 0.316 | 0.216 |
| -0.871999999999997 | 0.467 | 0.32 | 0.219 |
| -0.867999999999997 | 0.471 | 0.323 | 0.222 |
| -0.863999999999997 | 0.474 | 0.326 | 0.225 |
| -0.859999999999997 | 0.477 | 0.33 | 0.228 |
| -0.855999999999997 | 0.481 | 0.333 | 0.231 |
| -0.851999999999997 | 0.484 | 0.337 | 0.234 |
| -0.847999999999997 | 0.487 | 0.34 | 0.237 |
| -0.843999999999997 | 0.49 | 0.344 | 0.241 |
| -0.839999999999997 | 0.494 | 0.347 | 0.244 |
| -0.835999999999997 | 0.497 | 0.351 | 0.247 |
| -0.831999999999997 | 0.5 | 0.354 | 0.25 |
| -0.827999999999997 | 0.504 | 0.358 | 0.254 |
| -0.823999999999997 | 0.507 | 0.361 | 0.257 |
| -0.819999999999997 | 0.51 | 0.365 | 0.261 |
| -0.815999999999997 | 0.514 | 0.368 | 0.264 |
| -0.811999999999997 | 0.517 | 0.372 | 0.267 |
| -0.807999999999997 | 0.521 | 0.376 | 0.271 |
| -0.803999999999997 | 0.524 | 0.379 | 0.274 |
| -0.799999999999997 | 0.527 | 0.383 | 0.278 |
| -0.795999999999997 | 0.531 | 0.387 | 0.282 |
| -0.791999999999997 | 0.534 | 0.39 | 0.285 |
| -0.787999999999997 | 0.537 | 0.394 | 0.289 |
| -0.783999999999997 | 0.541 | 0.398 | 0.292 |
| -0.779999999999997 | 0.544 | 0.401 | 0.296 |
| -0.775999999999997 | 0.548 | 0.405 | 0.3 |
| -0.771999999999997 | 0.551 | 0.409 | 0.304 |
| -0.767999999999997 | 0.554 | 0.413 | 0.307 |
| -0.763999999999997 | 0.558 | 0.417 | 0.311 |
| -0.759999999999997 | 0.561 | 0.42 | 0.315 |
| -0.755999999999997 | 0.565 | 0.424 | 0.319 |
| -0.751999999999997 | 0.568 | 0.428 | 0.323 |
| -0.747999999999997 | 0.571 | 0.432 | 0.327 |
| -0.743999999999997 | 0.575 | 0.436 | 0.331 |
| -0.739999999999997 | 0.578 | 0.44 | 0.334 |
| -0.735999999999997 | 0.582 | 0.444 | 0.338 |
| -0.731999999999997 | 0.585 | 0.448 | 0.342 |
| -0.727999999999997 | 0.589 | 0.452 | 0.346 |
| -0.723999999999997 | 0.592 | 0.456 | 0.351 |
| -0.719999999999997 | 0.595 | 0.46 | 0.355 |
| -0.715999999999997 | 0.599 | 0.463 | 0.359 |
| -0.711999999999997 | 0.602 | 0.467 | 0.363 |
| -0.707999999999997 | 0.606 | 0.471 | 0.367 |
| -0.703999999999997 | 0.609 | 0.475 | 0.371 |
| -0.699999999999997 | 0.613 | 0.48 | 0.375 |
| -0.695999999999997 | 0.616 | 0.484 | 0.38 |
| -0.691999999999997 | 0.619 | 0.488 | 0.384 |
| -0.687999999999997 | 0.623 | 0.492 | 0.388 |
| -0.683999999999997 | 0.626 | 0.496 | 0.392 |
| -0.679999999999997 | 0.63 | 0.5 | 0.397 |
| -0.675999999999997 | 0.633 | 0.504 | 0.401 |
| -0.671999999999997 | 0.637 | 0.508 | 0.405 |
| -0.667999999999997 | 0.64 | 0.512 | 0.41 |
| -0.663999999999997 | 0.643 | 0.516 | 0.414 |
| -0.659999999999997 | 0.647 | 0.52 | 0.418 |
| -0.655999999999997 | 0.65 | 0.524 | 0.423 |
| -0.651999999999997 | 0.654 | 0.529 | 0.427 |
| -0.647999999999997 | 0.657 | 0.533 | 0.432 |
| -0.643999999999997 | 0.661 | 0.537 | 0.436 |
| -0.639999999999997 | 0.664 | 0.541 | 0.441 |
| -0.635999999999997 | 0.667 | 0.545 | 0.445 |
| -0.631999999999997 | 0.671 | 0.549 | 0.45 |
| -0.627999999999997 | 0.674 | 0.553 | 0.454 |
| -0.623999999999997 | 0.677 | 0.558 | 0.459 |
| -0.619999999999997 | 0.681 | 0.562 | 0.464 |
| -0.615999999999997 | 0.684 | 0.566 | 0.468 |
| -0.611999999999997 | 0.688 | 0.57 | 0.473 |
| -0.607999999999997 | 0.691 | 0.574 | 0.477 |
| -0.603999999999997 | 0.694 | 0.579 | 0.482 |
| -0.599999999999997 | 0.698 | 0.583 | 0.487 |
| -0.595999999999997 | 0.701 | 0.587 | 0.491 |
| -0.591999999999997 | 0.704 | 0.591 | 0.496 |
| -0.587999999999997 | 0.708 | 0.595 | 0.501 |
| -0.583999999999997 | 0.711 | 0.6 | 0.506 |
| -0.579999999999997 | 0.714 | 0.604 | 0.51 |
| -0.575999999999997 | 0.718 | 0.608 | 0.515 |
| -0.571999999999997 | 0.721 | 0.612 | 0.52 |
| -0.567999999999997 | 0.724 | 0.616 | 0.525 |
| -0.563999999999997 | 0.728 | 0.621 | 0.529 |
| -0.559999999999997 | 0.731 | 0.625 | 0.534 |
| -0.555999999999997 | 0.734 | 0.629 | 0.539 |
| -0.551999999999997 | 0.737 | 0.633 | 0.544 |
| -0.547999999999997 | 0.741 | 0.637 | 0.548 |
| -0.543999999999997 | 0.744 | 0.642 | 0.553 |
| -0.539999999999997 | 0.747 | 0.646 | 0.558 |
| -0.535999999999997 | 0.75 | 0.65 | 0.563 |
| -0.531999999999997 | 0.754 | 0.654 | 0.568 |
| -0.527999999999997 | 0.757 | 0.658 | 0.573 |
| -0.523999999999997 | 0.76 | 0.662 | 0.577 |
| -0.519999999999997 | 0.763 | 0.667 | 0.582 |
| -0.515999999999997 | 0.766 | 0.671 | 0.587 |
| -0.511999999999997 | 0.769 | 0.675 | 0.592 |
| -0.507999999999997 | 0.773 | 0.679 | 0.597 |
| -0.503999999999997 | 0.776 | 0.683 | 0.602 |
| -0.499999999999997 | 0.779 | 0.687 | 0.607 |
| -0.495999999999997 | 0.782 | 0.691 | 0.611 |
| -0.491999999999997 | 0.785 | 0.696 | 0.616 |
| -0.487999999999997 | 0.788 | 0.7 | 0.621 |
| -0.483999999999997 | 0.791 | 0.704 | 0.626 |
| -0.479999999999997 | 0.794 | 0.708 | 0.631 |
| -0.475999999999997 | 0.797 | 0.712 | 0.636 |
| -0.471999999999997 | 0.8 | 0.716 | 0.64 |
| -0.467999999999997 | 0.803 | 0.72 | 0.645 |
| -0.463999999999997 | 0.806 | 0.724 | 0.65 |
| -0.459999999999997 | 0.809 | 0.728 | 0.655 |
| -0.455999999999997 | 0.812 | 0.732 | 0.66 |
| -0.451999999999997 | 0.815 | 0.736 | 0.665 |
| -0.447999999999997 | 0.818 | 0.74 | 0.669 |
| -0.443999999999997 | 0.821 | 0.744 | 0.674 |
| -0.439999999999997 | 0.824 | 0.748 | 0.679 |
| -0.435999999999997 | 0.827 | 0.752 | 0.684 |
| -0.431999999999997 | 0.83 | 0.756 | 0.688 |
| -0.427999999999997 | 0.833 | 0.76 | 0.693 |
| -0.423999999999997 | 0.835 | 0.764 | 0.698 |
| -0.419999999999997 | 0.838 | 0.768 | 0.703 |
| -0.415999999999997 | 0.841 | 0.771 | 0.707 |
| -0.411999999999997 | 0.844 | 0.775 | 0.712 |
| -0.407999999999997 | 0.847 | 0.779 | 0.717 |
| -0.403999999999997 | 0.849 | 0.783 | 0.721 |
| -0.399999999999997 | 0.852 | 0.787 | 0.726 |
| -0.395999999999997 | 0.855 | 0.79 | 0.731 |
| -0.391999999999997 | 0.858 | 0.794 | 0.735 |
| -0.387999999999997 | 0.86 | 0.798 | 0.74 |
| -0.383999999999997 | 0.863 | 0.802 | 0.745 |
| -0.379999999999997 | 0.866 | 0.805 | 0.749 |
| -0.375999999999997 | 0.868 | 0.809 | 0.754 |
| -0.371999999999997 | 0.871 | 0.813 | 0.758 |
| -0.367999999999997 | 0.873 | 0.816 | 0.763 |
| -0.363999999999997 | 0.876 | 0.82 | 0.767 |
| -0.359999999999997 | 0.878 | 0.823 | 0.772 |
| -0.355999999999997 | 0.881 | 0.827 | 0.776 |
| -0.351999999999997 | 0.883 | 0.83 | 0.781 |
| -0.347999999999997 | 0.886 | 0.834 | 0.785 |
| -0.343999999999997 | 0.888 | 0.837 | 0.789 |
| -0.339999999999997 | 0.891 | 0.841 | 0.794 |
| -0.335999999999997 | 0.893 | 0.844 | 0.798 |
| -0.331999999999997 | 0.896 | 0.848 | 0.802 |
| -0.327999999999997 | 0.898 | 0.851 | 0.806 |
| -0.323999999999997 | 0.9 | 0.854 | 0.811 |
| -0.319999999999997 | 0.903 | 0.858 | 0.815 |
| -0.315999999999997 | 0.905 | 0.861 | 0.819 |
| -0.311999999999997 | 0.907 | 0.864 | 0.823 |
| -0.307999999999997 | 0.909 | 0.867 | 0.827 |
| -0.303999999999997 | 0.912 | 0.871 | 0.831 |
| -0.299999999999997 | 0.914 | 0.874 | 0.835 |
| -0.295999999999997 | 0.916 | 0.877 | 0.839 |
| -0.291999999999997 | 0.918 | 0.88 | 0.843 |
| -0.287999999999997 | 0.92 | 0.883 | 0.847 |
| -0.283999999999997 | 0.923 | 0.886 | 0.851 |
| -0.279999999999997 | 0.925 | 0.889 | 0.855 |
| -0.275999999999997 | 0.927 | 0.892 | 0.859 |
| -0.271999999999997 | 0.929 | 0.895 | 0.862 |
| -0.267999999999997 | 0.931 | 0.898 | 0.866 |
| -0.263999999999997 | 0.933 | 0.901 | 0.87 |
| -0.259999999999997 | 0.935 | 0.904 | 0.874 |
| -0.255999999999997 | 0.937 | 0.906 | 0.877 |
| -0.251999999999997 | 0.938 | 0.909 | 0.881 |
| -0.247999999999997 | 0.94 | 0.912 | 0.884 |
| -0.243999999999997 | 0.942 | 0.915 | 0.888 |
| -0.239999999999997 | 0.944 | 0.917 | 0.891 |
| -0.235999999999997 | 0.946 | 0.92 | 0.895 |
| -0.231999999999997 | 0.948 | 0.922 | 0.898 |
| -0.227999999999997 | 0.949 | 0.925 | 0.901 |
| -0.223999999999997 | 0.951 | 0.927 | 0.905 |
| -0.219999999999997 | 0.953 | 0.93 | 0.908 |
| -0.215999999999997 | 0.954 | 0.932 | 0.911 |
| -0.211999999999997 | 0.956 | 0.935 | 0.914 |
| -0.207999999999997 | 0.958 | 0.937 | 0.917 |
| -0.203999999999997 | 0.959 | 0.939 | 0.92 |
| -0.199999999999997 | 0.961 | 0.942 | 0.923 |
| -0.195999999999997 | 0.962 | 0.944 | 0.926 |
| -0.191999999999997 | 0.964 | 0.946 | 0.929 |
| -0.187999999999997 | 0.965 | 0.948 | 0.932 |
| -0.183999999999997 | 0.967 | 0.95 | 0.935 |
| -0.179999999999997 | 0.968 | 0.953 | 0.937 |
| -0.175999999999997 | 0.969 | 0.955 | 0.94 |
| -0.171999999999997 | 0.971 | 0.957 | 0.943 |
| -0.167999999999997 | 0.972 | 0.959 | 0.945 |
| -0.163999999999997 | 0.973 | 0.96 | 0.948 |
| -0.159999999999997 | 0.975 | 0.962 | 0.95 |
| -0.155999999999997 | 0.976 | 0.964 | 0.952 |
| -0.151999999999997 | 0.977 | 0.966 | 0.955 |
| -0.147999999999997 | 0.978 | 0.968 | 0.957 |
| -0.143999999999997 | 0.979 | 0.969 | 0.959 |
| -0.139999999999997 | 0.981 | 0.971 | 0.962 |
| -0.135999999999997 | 0.982 | 0.973 | 0.964 |
| -0.131999999999997 | 0.983 | 0.974 | 0.966 |
| -0.127999999999997 | 0.984 | 0.976 | 0.968 |
| -0.123999999999997 | 0.985 | 0.977 | 0.97 |
| -0.119999999999997 | 0.986 | 0.979 | 0.972 |
| -0.115999999999997 | 0.987 | 0.98 | 0.973 |
| -0.111999999999997 | 0.988 | 0.981 | 0.975 |
| -0.107999999999997 | 0.988 | 0.983 | 0.977 |
| -0.103999999999997 | 0.989 | 0.984 | 0.979 |
| -0.0999999999999965 | 0.99 | 0.985 | 0.98 |
| -0.0959999999999965 | 0.991 | 0.986 | 0.982 |
| -0.0919999999999965 | 0.992 | 0.987 | 0.983 |
| -0.0879999999999965 | 0.992 | 0.988 | 0.985 |
| -0.0839999999999965 | 0.993 | 0.989 | 0.986 |
| -0.0799999999999965 | 0.994 | 0.99 | 0.987 |
| -0.0759999999999965 | 0.994 | 0.991 | 0.989 |
| -0.0719999999999965 | 0.995 | 0.992 | 0.99 |
| -0.0679999999999965 | 0.995 | 0.993 | 0.991 |
| -0.0639999999999965 | 0.996 | 0.994 | 0.992 |
| -0.0599999999999965 | 0.996 | 0.995 | 0.993 |
| -0.0559999999999965 | 0.997 | 0.995 | 0.994 |
| -0.0519999999999965 | 0.997 | 0.996 | 0.995 |
| -0.0479999999999965 | 0.998 | 0.997 | 0.995 |
| -0.0439999999999965 | 0.998 | 0.997 | 0.996 |
| -0.0399999999999965 | 0.998 | 0.998 | 0.997 |
| -0.0359999999999965 | 0.999 | 0.998 | 0.997 |
| -0.0319999999999965 | 0.999 | 0.998 | 0.998 |
| -0.0279999999999965 | 0.999 | 0.999 | 0.998 |
| -0.0239999999999965 | 0.999 | 0.999 | 0.999 |
| -0.0199999999999965 | 1 | 0.999 | 0.999 |
| -0.0159999999999965 | 1 | 1 | 0.999 |
| -0.0119999999999965 | 1 | 1 | 1 |
| -0.00799999999999647 | 1 | 1 | 1 |
| -0.00399999999999647 | 1 | 1 | 1 |
| 3.52495810318487e-15 | 1 | 1 | 1 |
| 0.00400000000000352 | 1 | 1 | 1 |
| 0.00800000000000352 | 1 | 1 | 1 |
| 0.0120000000000035 | 1 | 1 | 1 |
| 0.0160000000000035 | 1 | 1 | 0.999 |
| 0.0200000000000035 | 1 | 0.999 | 0.999 |
| 0.0240000000000035 | 0.999 | 0.999 | 0.999 |
| 0.0280000000000035 | 0.999 | 0.999 | 0.998 |
| 0.0320000000000035 | 0.999 | 0.998 | 0.998 |
| 0.0360000000000035 | 0.999 | 0.998 | 0.997 |
| 0.0400000000000035 | 0.998 | 0.998 | 0.997 |
| 0.0440000000000035 | 0.998 | 0.997 | 0.996 |
| 0.0480000000000035 | 0.998 | 0.997 | 0.995 |
| 0.0520000000000035 | 0.997 | 0.996 | 0.995 |
| 0.0560000000000035 | 0.997 | 0.995 | 0.994 |
| 0.0600000000000035 | 0.996 | 0.995 | 0.993 |
| 0.0640000000000035 | 0.996 | 0.994 | 0.992 |
| 0.0680000000000035 | 0.995 | 0.993 | 0.991 |
| 0.0720000000000036 | 0.995 | 0.992 | 0.99 |
| 0.0760000000000036 | 0.994 | 0.991 | 0.989 |
| 0.0800000000000036 | 0.994 | 0.99 | 0.987 |
| 0.0840000000000036 | 0.993 | 0.989 | 0.986 |
| 0.0880000000000036 | 0.992 | 0.988 | 0.985 |
| 0.0920000000000036 | 0.992 | 0.987 | 0.983 |
| 0.0960000000000036 | 0.991 | 0.986 | 0.982 |
| 0.100000000000004 | 0.99 | 0.985 | 0.98 |
| 0.104000000000004 | 0.989 | 0.984 | 0.979 |
| 0.108000000000004 | 0.988 | 0.983 | 0.977 |
| 0.112000000000004 | 0.988 | 0.981 | 0.975 |
| 0.116000000000004 | 0.987 | 0.98 | 0.973 |
| 0.120000000000004 | 0.986 | 0.979 | 0.972 |
| 0.124000000000004 | 0.985 | 0.977 | 0.97 |
| 0.128000000000004 | 0.984 | 0.976 | 0.968 |
| 0.132000000000004 | 0.983 | 0.974 | 0.966 |
| 0.136000000000004 | 0.982 | 0.973 | 0.964 |
| 0.140000000000004 | 0.981 | 0.971 | 0.962 |
| 0.144000000000004 | 0.979 | 0.969 | 0.959 |
| 0.148000000000004 | 0.978 | 0.968 | 0.957 |
| 0.152000000000004 | 0.977 | 0.966 | 0.955 |
| 0.156000000000004 | 0.976 | 0.964 | 0.952 |
| 0.160000000000004 | 0.975 | 0.962 | 0.95 |
| 0.164000000000004 | 0.973 | 0.96 | 0.948 |
| 0.168000000000004 | 0.972 | 0.959 | 0.945 |
| 0.172000000000004 | 0.971 | 0.957 | 0.943 |
| 0.176000000000004 | 0.969 | 0.955 | 0.94 |
| 0.180000000000004 | 0.968 | 0.953 | 0.937 |
| 0.184000000000004 | 0.967 | 0.95 | 0.935 |
| 0.188000000000004 | 0.965 | 0.948 | 0.932 |
| 0.192000000000004 | 0.964 | 0.946 | 0.929 |
| 0.196000000000004 | 0.962 | 0.944 | 0.926 |
| 0.200000000000004 | 0.961 | 0.942 | 0.923 |
| 0.204000000000004 | 0.959 | 0.939 | 0.92 |
| 0.208000000000004 | 0.958 | 0.937 | 0.917 |
| 0.212000000000004 | 0.956 | 0.935 | 0.914 |
| 0.216000000000004 | 0.954 | 0.932 | 0.911 |
| 0.220000000000004 | 0.953 | 0.93 | 0.908 |
| 0.224000000000004 | 0.951 | 0.927 | 0.905 |
| 0.228000000000004 | 0.949 | 0.925 | 0.901 |
| 0.232000000000004 | 0.948 | 0.922 | 0.898 |
| 0.236000000000004 | 0.946 | 0.92 | 0.895 |
| 0.240000000000004 | 0.944 | 0.917 | 0.891 |
| 0.244000000000004 | 0.942 | 0.915 | 0.888 |
| 0.248000000000004 | 0.94 | 0.912 | 0.884 |
| 0.252000000000004 | 0.938 | 0.909 | 0.881 |
| 0.256000000000004 | 0.937 | 0.906 | 0.877 |
| 0.260000000000004 | 0.935 | 0.904 | 0.874 |
| 0.264000000000004 | 0.933 | 0.901 | 0.87 |
| 0.268000000000004 | 0.931 | 0.898 | 0.866 |
| 0.272000000000004 | 0.929 | 0.895 | 0.862 |
| 0.276000000000004 | 0.927 | 0.892 | 0.859 |
| 0.280000000000004 | 0.925 | 0.889 | 0.855 |
| 0.284000000000004 | 0.923 | 0.886 | 0.851 |
| 0.288000000000004 | 0.92 | 0.883 | 0.847 |
| 0.292000000000004 | 0.918 | 0.88 | 0.843 |
| 0.296000000000004 | 0.916 | 0.877 | 0.839 |
| 0.300000000000004 | 0.914 | 0.874 | 0.835 |
| 0.304000000000004 | 0.912 | 0.871 | 0.831 |
| 0.308000000000004 | 0.909 | 0.867 | 0.827 |
| 0.312000000000004 | 0.907 | 0.864 | 0.823 |
| 0.316000000000004 | 0.905 | 0.861 | 0.819 |
| 0.320000000000004 | 0.903 | 0.858 | 0.815 |
| 0.324000000000004 | 0.9 | 0.854 | 0.811 |
| 0.328000000000004 | 0.898 | 0.851 | 0.806 |
| 0.332000000000004 | 0.896 | 0.848 | 0.802 |
| 0.336000000000004 | 0.893 | 0.844 | 0.798 |
| 0.340000000000004 | 0.891 | 0.841 | 0.794 |
| 0.344000000000004 | 0.888 | 0.837 | 0.789 |
| 0.348000000000004 | 0.886 | 0.834 | 0.785 |
| 0.352000000000004 | 0.883 | 0.83 | 0.781 |
| 0.356000000000004 | 0.881 | 0.827 | 0.776 |
| 0.360000000000004 | 0.878 | 0.823 | 0.772 |
| 0.364000000000004 | 0.876 | 0.82 | 0.767 |
| 0.368000000000004 | 0.873 | 0.816 | 0.763 |
| 0.372000000000004 | 0.871 | 0.813 | 0.758 |
| 0.376000000000004 | 0.868 | 0.809 | 0.754 |
| 0.380000000000004 | 0.866 | 0.805 | 0.749 |
| 0.384000000000004 | 0.863 | 0.802 | 0.745 |
| 0.388000000000004 | 0.86 | 0.798 | 0.74 |
| 0.392000000000004 | 0.858 | 0.794 | 0.735 |
| 0.396000000000004 | 0.855 | 0.79 | 0.731 |
| 0.400000000000004 | 0.852 | 0.787 | 0.726 |
| 0.404000000000004 | 0.849 | 0.783 | 0.721 |
| 0.408000000000004 | 0.847 | 0.779 | 0.717 |
| 0.412000000000004 | 0.844 | 0.775 | 0.712 |
| 0.416000000000004 | 0.841 | 0.771 | 0.707 |
| 0.420000000000004 | 0.838 | 0.768 | 0.703 |
| 0.424000000000004 | 0.835 | 0.764 | 0.698 |
| 0.428000000000004 | 0.833 | 0.76 | 0.693 |
| 0.432000000000004 | 0.83 | 0.756 | 0.688 |
| 0.436000000000004 | 0.827 | 0.752 | 0.684 |
| 0.440000000000004 | 0.824 | 0.748 | 0.679 |
| 0.444000000000004 | 0.821 | 0.744 | 0.674 |
| 0.448000000000004 | 0.818 | 0.74 | 0.669 |
| 0.452000000000004 | 0.815 | 0.736 | 0.665 |
| 0.456000000000004 | 0.812 | 0.732 | 0.66 |
| 0.460000000000004 | 0.809 | 0.728 | 0.655 |
| 0.464000000000004 | 0.806 | 0.724 | 0.65 |
| 0.468000000000004 | 0.803 | 0.72 | 0.645 |
| 0.472000000000004 | 0.8 | 0.716 | 0.64 |
| 0.476000000000004 | 0.797 | 0.712 | 0.636 |
| 0.480000000000004 | 0.794 | 0.708 | 0.631 |
| 0.484000000000004 | 0.791 | 0.704 | 0.626 |
| 0.488000000000004 | 0.788 | 0.7 | 0.621 |
| 0.492000000000004 | 0.785 | 0.696 | 0.616 |
| 0.496000000000004 | 0.782 | 0.691 | 0.611 |
| 0.500000000000004 | 0.779 | 0.687 | 0.607 |
| 0.504000000000004 | 0.776 | 0.683 | 0.602 |
| 0.508000000000004 | 0.773 | 0.679 | 0.597 |
| 0.512000000000004 | 0.769 | 0.675 | 0.592 |
| 0.516000000000004 | 0.766 | 0.671 | 0.587 |
| 0.520000000000004 | 0.763 | 0.667 | 0.582 |
| 0.524000000000004 | 0.76 | 0.662 | 0.577 |
| 0.528000000000004 | 0.757 | 0.658 | 0.573 |
| 0.532000000000004 | 0.754 | 0.654 | 0.568 |
| 0.536000000000004 | 0.75 | 0.65 | 0.563 |
| 0.540000000000004 | 0.747 | 0.646 | 0.558 |
| 0.544000000000004 | 0.744 | 0.642 | 0.553 |
| 0.548000000000004 | 0.741 | 0.637 | 0.548 |
| 0.552000000000004 | 0.737 | 0.633 | 0.544 |
| 0.556000000000004 | 0.734 | 0.629 | 0.539 |
| 0.560000000000004 | 0.731 | 0.625 | 0.534 |
| 0.564000000000004 | 0.728 | 0.621 | 0.529 |
| 0.568000000000004 | 0.724 | 0.616 | 0.525 |
| 0.572000000000004 | 0.721 | 0.612 | 0.52 |
| 0.576000000000004 | 0.718 | 0.608 | 0.515 |
| 0.580000000000004 | 0.714 | 0.604 | 0.51 |
| 0.584000000000004 | 0.711 | 0.6 | 0.506 |
| 0.588000000000004 | 0.708 | 0.595 | 0.501 |
| 0.592000000000004 | 0.704 | 0.591 | 0.496 |
| 0.596000000000004 | 0.701 | 0.587 | 0.491 |
| 0.600000000000004 | 0.698 | 0.583 | 0.487 |
| 0.604000000000004 | 0.694 | 0.579 | 0.482 |
| 0.608000000000004 | 0.691 | 0.574 | 0.477 |
| 0.612000000000004 | 0.688 | 0.57 | 0.473 |
| 0.616000000000004 | 0.684 | 0.566 | 0.468 |
| 0.620000000000004 | 0.681 | 0.562 | 0.464 |
| 0.624000000000004 | 0.677 | 0.558 | 0.459 |
| 0.628000000000004 | 0.674 | 0.553 | 0.454 |
| 0.632000000000004 | 0.671 | 0.549 | 0.45 |
| 0.636000000000004 | 0.667 | 0.545 | 0.445 |
| 0.640000000000004 | 0.664 | 0.541 | 0.441 |
| 0.644000000000004 | 0.661 | 0.537 | 0.436 |
| 0.648000000000004 | 0.657 | 0.533 | 0.432 |
| 0.652000000000004 | 0.654 | 0.529 | 0.427 |
| 0.656000000000004 | 0.65 | 0.524 | 0.423 |
| 0.660000000000004 | 0.647 | 0.52 | 0.418 |
| 0.664000000000004 | 0.643 | 0.516 | 0.414 |
| 0.668000000000004 | 0.64 | 0.512 | 0.41 |
| 0.672000000000004 | 0.637 | 0.508 | 0.405 |
| 0.676000000000004 | 0.633 | 0.504 | 0.401 |
| 0.680000000000004 | 0.63 | 0.5 | 0.397 |
| 0.684000000000004 | 0.626 | 0.496 | 0.392 |
| 0.688000000000004 | 0.623 | 0.492 | 0.388 |
| 0.692000000000004 | 0.619 | 0.488 | 0.384 |
| 0.696000000000004 | 0.616 | 0.484 | 0.38 |
| 0.700000000000004 | 0.613 | 0.48 | 0.375 |
| 0.704000000000004 | 0.609 | 0.475 | 0.371 |
| 0.708000000000004 | 0.606 | 0.471 | 0.367 |
| 0.712000000000004 | 0.602 | 0.467 | 0.363 |
| 0.716000000000004 | 0.599 | 0.463 | 0.359 |
| 0.720000000000004 | 0.595 | 0.46 | 0.355 |
| 0.724000000000004 | 0.592 | 0.456 | 0.351 |
| 0.728000000000004 | 0.589 | 0.452 | 0.346 |
| 0.732000000000004 | 0.585 | 0.448 | 0.342 |
| 0.736000000000004 | 0.582 | 0.444 | 0.338 |
| 0.740000000000004 | 0.578 | 0.44 | 0.334 |
| 0.744000000000004 | 0.575 | 0.436 | 0.331 |
| 0.748000000000004 | 0.571 | 0.432 | 0.327 |
| 0.752000000000004 | 0.568 | 0.428 | 0.323 |
| 0.756000000000004 | 0.565 | 0.424 | 0.319 |
| 0.760000000000004 | 0.561 | 0.42 | 0.315 |
| 0.764000000000004 | 0.558 | 0.417 | 0.311 |
| 0.768000000000004 | 0.554 | 0.413 | 0.307 |
| 0.772000000000004 | 0.551 | 0.409 | 0.304 |
| 0.776000000000004 | 0.548 | 0.405 | 0.3 |
| 0.780000000000004 | 0.544 | 0.401 | 0.296 |
| 0.784000000000004 | 0.541 | 0.398 | 0.292 |
| 0.788000000000004 | 0.537 | 0.394 | 0.289 |
| 0.792000000000004 | 0.534 | 0.39 | 0.285 |
| 0.796000000000004 | 0.531 | 0.387 | 0.282 |
| 0.800000000000004 | 0.527 | 0.383 | 0.278 |
| 0.804000000000004 | 0.524 | 0.379 | 0.274 |
| 0.808000000000004 | 0.521 | 0.376 | 0.271 |
| 0.812000000000004 | 0.517 | 0.372 | 0.267 |
| 0.816000000000004 | 0.514 | 0.368 | 0.264 |
| 0.820000000000004 | 0.51 | 0.365 | 0.261 |
| 0.824000000000004 | 0.507 | 0.361 | 0.257 |
| 0.828000000000004 | 0.504 | 0.358 | 0.254 |
| 0.832000000000004 | 0.5 | 0.354 | 0.25 |
| 0.836000000000004 | 0.497 | 0.351 | 0.247 |
| 0.840000000000004 | 0.494 | 0.347 | 0.244 |
| 0.844000000000004 | 0.49 | 0.344 | 0.241 |
| 0.848000000000004 | 0.487 | 0.34 | 0.237 |
| 0.852000000000004 | 0.484 | 0.337 | 0.234 |
| 0.856000000000004 | 0.481 | 0.333 | 0.231 |
| 0.860000000000004 | 0.477 | 0.33 | 0.228 |
| 0.864000000000004 | 0.474 | 0.326 | 0.225 |
| 0.868000000000004 | 0.471 | 0.323 | 0.222 |
| 0.872000000000004 | 0.467 | 0.32 | 0.219 |
| 0.876000000000004 | 0.464 | 0.316 | 0.216 |
| 0.880000000000004 | 0.461 | 0.313 | 0.213 |
| 0.884000000000004 | 0.458 | 0.31 | 0.21 |
| 0.888000000000004 | 0.455 | 0.306 | 0.207 |
| 0.892000000000004 | 0.451 | 0.303 | 0.204 |
| 0.896000000000004 | 0.448 | 0.3 | 0.201 |
| 0.900000000000004 | 0.445 | 0.297 | 0.198 |
| 0.904000000000004 | 0.442 | 0.294 | 0.195 |
| 0.908000000000004 | 0.438 | 0.29 | 0.192 |
| 0.912000000000004 | 0.435 | 0.287 | 0.189 |
| 0.916000000000004 | 0.432 | 0.284 | 0.187 |
| 0.920000000000004 | 0.429 | 0.281 | 0.184 |
| 0.924000000000004 | 0.426 | 0.278 | 0.181 |
| 0.928000000000004 | 0.423 | 0.275 | 0.179 |
| 0.932000000000004 | 0.42 | 0.272 | 0.176 |
| 0.936000000000004 | 0.416 | 0.269 | 0.173 |
| 0.940000000000004 | 0.413 | 0.266 | 0.171 |
| 0.944000000000004 | 0.41 | 0.263 | 0.168 |
| 0.948000000000004 | 0.407 | 0.26 | 0.166 |
| 0.952000000000004 | 0.404 | 0.257 | 0.163 |
| 0.956000000000004 | 0.401 | 0.254 | 0.161 |
| 0.960000000000004 | 0.398 | 0.251 | 0.158 |
| 0.964000000000004 | 0.395 | 0.248 | 0.156 |
| 0.968000000000004 | 0.392 | 0.245 | 0.154 |
| 0.972000000000004 | 0.389 | 0.242 | 0.151 |
| 0.976000000000004 | 0.386 | 0.24 | 0.149 |
| 0.980000000000004 | 0.383 | 0.237 | 0.146 |
| 0.984000000000004 | 0.38 | 0.234 | 0.144 |
| 0.988000000000004 | 0.377 | 0.231 | 0.142 |
| 0.992000000000004 | 0.374 | 0.229 | 0.14 |
| 0.996000000000004 | 0.371 | 0.226 | 0.138 |
| 1.000000000000004 | 0.368 | 0.223 | 0.135 |
| 1.004000000000004 | 0.365 | 0.22 | 0.133 |
| 1.008000000000004 | 0.362 | 0.218 | 0.131 |
| 1.012000000000004 | 0.359 | 0.215 | 0.129 |
| 1.016000000000004 | 0.356 | 0.213 | 0.127 |
| 1.020000000000004 | 0.353 | 0.21 | 0.125 |
| 1.024000000000004 | 0.35 | 0.207 | 0.123 |
| 1.028000000000004 | 0.348 | 0.205 | 0.121 |
| 1.032000000000004 | 0.345 | 0.202 | 0.119 |
| 1.036000000000004 | 0.342 | 0.2 | 0.117 |
| 1.040000000000004 | 0.339 | 0.197 | 0.115 |
| 1.044000000000004 | 0.336 | 0.195 | 0.113 |
| 1.048000000000004 | 0.333 | 0.193 | 0.111 |
| 1.052000000000004 | 0.331 | 0.19 | 0.109 |
| 1.056000000000004 | 0.328 | 0.188 | 0.107 |
| 1.060000000000004 | 0.325 | 0.185 | 0.106 |
| 1.064000000000004 | 0.322 | 0.183 | 0.104 |
| 1.068000000000004 | 0.32 | 0.181 | 0.102 |
| 1.072000000000004 | 0.317 | 0.178 | 0.1 |
| 1.076000000000004 | 0.314 | 0.176 | 0.099 |
| 1.080000000000004 | 0.311 | 0.174 | 0.097 |
| 1.084000000000004 | 0.309 | 0.172 | 0.095 |
| 1.088000000000004 | 0.306 | 0.169 | 0.094 |
| 1.092000000000004 | 0.303 | 0.167 | 0.092 |
| 1.096000000000004 | 0.301 | 0.165 | 0.09 |
| 1.100000000000004 | 0.298 | 0.163 | 0.089 |
| 1.104000000000004 | 0.296 | 0.161 | 0.087 |
| 1.108000000000004 | 0.293 | 0.159 | 0.086 |
| 1.112000000000004 | 0.29 | 0.156 | 0.084 |
| 1.116000000000004 | 0.288 | 0.154 | 0.083 |
| 1.120000000000004 | 0.285 | 0.152 | 0.081 |
| 1.124000000000004 | 0.283 | 0.15 | 0.08 |
| 1.128000000000004 | 0.28 | 0.148 | 0.078 |
| 1.132000000000004 | 0.278 | 0.146 | 0.077 |
| 1.136000000000004 | 0.275 | 0.144 | 0.076 |
| 1.140000000000004 | 0.273 | 0.142 | 0.074 |
| 1.144000000000004 | 0.27 | 0.14 | 0.073 |
| 1.148000000000004 | 0.268 | 0.139 | 0.072 |
| 1.152000000000004 | 0.265 | 0.137 | 0.07 |
| 1.156000000000004 | 0.263 | 0.135 | 0.069 |
| 1.160000000000004 | 0.26 | 0.133 | 0.068 |
| 1.164000000000004 | 0.258 | 0.131 | 0.067 |
| 1.168000000000004 | 0.256 | 0.129 | 0.065 |
| 1.172000000000004 | 0.253 | 0.127 | 0.064 |
| 1.176000000000004 | 0.251 | 0.126 | 0.063 |
| 1.180000000000004 | 0.248 | 0.124 | 0.062 |
| 1.184000000000004 | 0.246 | 0.122 | 0.061 |
| 1.188000000000004 | 0.244 | 0.12 | 0.059 |
| 1.192000000000004 | 0.242 | 0.119 | 0.058 |
| 1.196000000000004 | 0.239 | 0.117 | 0.057 |
| 1.200000000000004 | 0.237 | 0.115 | 0.056 |
| 1.204000000000004 | 0.235 | 0.114 | 0.055 |
| 1.208000000000004 | 0.232 | 0.112 | 0.054 |
| 1.212000000000004 | 0.23 | 0.11 | 0.053 |
| 1.216000000000004 | 0.228 | 0.109 | 0.052 |
| 1.220000000000004 | 0.226 | 0.107 | 0.051 |
| 1.224000000000004 | 0.224 | 0.106 | 0.05 |
| 1.228000000000004 | 0.221 | 0.104 | 0.049 |
| 1.232000000000004 | 0.219 | 0.103 | 0.048 |
| 1.236000000000004 | 0.217 | 0.101 | 0.047 |
| 1.240000000000004 | 0.215 | 0.1 | 0.046 |
| 1.244000000000004 | 0.213 | 0.098 | 0.045 |
| 1.248000000000004 | 0.211 | 0.097 | 0.044 |
| 1.252000000000004 | 0.209 | 0.095 | 0.043 |
| 1.256000000000004 | 0.206 | 0.094 | 0.043 |
| 1.260000000000004 | 0.204 | 0.092 | 0.042 |
| 1.264000000000004 | 0.202 | 0.091 | 0.041 |
| 1.268000000000004 | 0.2 | 0.09 | 0.04 |
| 1.272000000000004 | 0.198 | 0.088 | 0.039 |
| 1.276000000000004 | 0.196 | 0.087 | 0.039 |
| 1.280000000000004 | 0.194 | 0.086 | 0.038 |
| 1.284000000000004 | 0.192 | 0.084 | 0.037 |
| 1.288000000000004 | 0.19 | 0.083 | 0.036 |
| 1.292000000000004 | 0.188 | 0.082 | 0.035 |
| 1.296000000000004 | 0.186 | 0.081 | 0.035 |
| 1.300000000000004 | 0.185 | 0.079 | 0.034 |
| 1.304000000000004 | 0.183 | 0.078 | 0.033 |
| 1.308000000000004 | 0.181 | 0.077 | 0.033 |
| 1.312000000000004 | 0.179 | 0.076 | 0.032 |
| 1.316000000000004 | 0.177 | 0.074 | 0.031 |
| 1.320000000000004 | 0.175 | 0.073 | 0.031 |
| 1.324000000000004 | 0.173 | 0.072 | 0.03 |
| 1.328000000000004 | 0.171 | 0.071 | 0.029 |
| 1.332000000000004 | 0.17 | 0.07 | 0.029 |
| 1.336000000000004 | 0.168 | 0.069 | 0.028 |
| 1.340000000000004 | 0.166 | 0.068 | 0.028 |
| 1.344000000000004 | 0.164 | 0.067 | 0.027 |
| 1.348000000000004 | 0.162 | 0.066 | 0.026 |
| 1.352000000000004 | 0.161 | 0.064 | 0.026 |
| 1.356000000000004 | 0.159 | 0.063 | 0.025 |
| 1.360000000000004 | 0.157 | 0.062 | 0.025 |
| 1.364000000000004 | 0.156 | 0.061 | 0.024 |
| 1.368000000000004 | 0.154 | 0.06 | 0.024 |
| 1.372000000000004 | 0.152 | 0.059 | 0.023 |
| 1.376000000000004 | 0.151 | 0.058 | 0.023 |
| 1.380000000000004 | 0.149 | 0.057 | 0.022 |
| 1.384000000000004 | 0.147 | 0.057 | 0.022 |
| 1.388000000000005 | 0.146 | 0.056 | 0.021 |
| 1.392000000000004 | 0.144 | 0.055 | 0.021 |
| 1.396000000000004 | 0.142 | 0.054 | 0.02 |
| 1.400000000000005 | 0.141 | 0.053 | 0.02 |
| 1.404000000000005 | 0.139 | 0.052 | 0.019 |
| 1.408000000000005 | 0.138 | 0.051 | 0.019 |
| 1.412000000000005 | 0.136 | 0.05 | 0.019 |
| 1.416000000000005 | 0.135 | 0.049 | 0.018 |
| 1.420000000000005 | 0.133 | 0.049 | 0.018 |
| 1.424000000000005 | 0.132 | 0.048 | 0.017 |
| 1.428000000000005 | 0.13 | 0.047 | 0.017 |
| 1.432000000000005 | 0.129 | 0.046 | 0.017 |
| 1.436000000000005 | 0.127 | 0.045 | 0.016 |
| 1.440000000000005 | 0.126 | 0.045 | 0.016 |
| 1.444000000000005 | 0.124 | 0.044 | 0.015 |
| 1.448000000000005 | 0.123 | 0.043 | 0.015 |
| 1.452000000000005 | 0.121 | 0.042 | 0.015 |
| 1.456000000000005 | 0.12 | 0.042 | 0.014 |
| 1.460000000000005 | 0.119 | 0.041 | 0.014 |
| 1.464000000000005 | 0.117 | 0.04 | 0.014 |
| 1.468000000000005 | 0.116 | 0.039 | 0.013 |
| 1.472000000000005 | 0.115 | 0.039 | 0.013 |
| 1.476000000000005 | 0.113 | 0.038 | 0.013 |
| 1.480000000000005 | 0.112 | 0.037 | 0.013 |
| 1.484000000000005 | 0.111 | 0.037 | 0.012 |
| 1.488000000000005 | 0.109 | 0.036 | 0.012 |
| 1.492000000000005 | 0.108 | 0.035 | 0.012 |
| 1.496000000000005 | 0.107 | 0.035 | 0.011 |
| 1.500000000000005 | 0.105 | 0.034 | 0.011 |
| 1.504000000000005 | 0.104 | 0.034 | 0.011 |
| 1.508000000000005 | 0.103 | 0.033 | 0.011 |
| 1.512000000000005 | 0.102 | 0.032 | 0.01 |
| 1.516000000000005 | 0.1 | 0.032 | 0.01 |
| 1.520000000000005 | 0.099 | 0.031 | 0.01 |
| 1.524000000000005 | 0.098 | 0.031 | 0.01 |
| 1.528000000000005 | 0.097 | 0.03 | 0.009 |
| 1.532000000000005 | 0.096 | 0.03 | 0.009 |
| 1.536000000000005 | 0.094 | 0.029 | 0.009 |
| 1.540000000000005 | 0.093 | 0.029 | 0.009 |
| 1.544000000000005 | 0.092 | 0.028 | 0.008 |
| 1.548000000000005 | 0.091 | 0.027 | 0.008 |
| 1.552000000000005 | 0.09 | 0.027 | 0.008 |
| 1.556000000000005 | 0.089 | 0.026 | 0.008 |
| 1.560000000000005 | 0.088 | 0.026 | 0.008 |
| 1.564000000000005 | 0.087 | 0.025 | 0.008 |
| 1.568000000000005 | 0.086 | 0.025 | 0.007 |
| 1.572000000000005 | 0.084 | 0.025 | 0.007 |
| 1.576000000000005 | 0.083 | 0.024 | 0.007 |
| 1.580000000000005 | 0.082 | 0.024 | 0.007 |
| 1.584000000000005 | 0.081 | 0.023 | 0.007 |
| 1.588000000000005 | 0.08 | 0.023 | 0.006 |
| 1.592000000000005 | 0.079 | 0.022 | 0.006 |
| 1.596000000000005 | 0.078 | 0.022 | 0.006 |
| 1.600000000000005 | 0.077 | 0.021 | 0.006 |
| 1.604000000000005 | 0.076 | 0.021 | 0.006 |
| 1.608000000000005 | 0.075 | 0.021 | 0.006 |
| 1.612000000000005 | 0.074 | 0.02 | 0.006 |
| 1.616000000000005 | 0.073 | 0.02 | 0.005 |
| 1.620000000000005 | 0.072 | 0.02 | 0.005 |
| 1.624000000000005 | 0.072 | 0.019 | 0.005 |
| 1.628000000000005 | 0.071 | 0.019 | 0.005 |
| 1.632000000000005 | 0.07 | 0.018 | 0.005 |
| 1.636000000000005 | 0.069 | 0.018 | 0.005 |
| 1.640000000000005 | 0.068 | 0.018 | 0.005 |
| 1.644000000000005 | 0.067 | 0.017 | 0.004 |
| 1.648000000000005 | 0.066 | 0.017 | 0.004 |
| 1.652000000000005 | 0.065 | 0.017 | 0.004 |
| 1.656000000000005 | 0.064 | 0.016 | 0.004 |
| 1.660000000000005 | 0.064 | 0.016 | 0.004 |
| 1.664000000000005 | 0.063 | 0.016 | 0.004 |
| 1.668000000000005 | 0.062 | 0.015 | 0.004 |
| 1.672000000000005 | 0.061 | 0.015 | 0.004 |
| 1.676000000000005 | 0.06 | 0.015 | 0.004 |
| 1.680000000000005 | 0.059 | 0.015 | 0.004 |
| 1.684000000000005 | 0.059 | 0.014 | 0.003 |
| 1.688000000000005 | 0.058 | 0.014 | 0.003 |
| 1.692000000000005 | 0.057 | 0.014 | 0.003 |
| 1.696000000000005 | 0.056 | 0.013 | 0.003 |
| 1.700000000000005 | 0.056 | 0.013 | 0.003 |
| 1.704000000000005 | 0.055 | 0.013 | 0.003 |
| 1.708000000000005 | 0.054 | 0.013 | 0.003 |
| 1.712000000000005 | 0.053 | 0.012 | 0.003 |
| 1.716000000000005 | 0.053 | 0.012 | 0.003 |
| 1.720000000000005 | 0.052 | 0.012 | 0.003 |
| 1.724000000000005 | 0.051 | 0.012 | 0.003 |
| 1.728000000000005 | 0.05 | 0.011 | 0.003 |
| 1.732000000000005 | 0.05 | 0.011 | 0.002 |
| 1.736000000000005 | 0.049 | 0.011 | 0.002 |
| 1.740000000000005 | 0.048 | 0.011 | 0.002 |
| 1.744000000000005 | 0.048 | 0.01 | 0.002 |
| 1.748000000000005 | 0.047 | 0.01 | 0.002 |
| 1.752000000000005 | 0.046 | 0.01 | 0.002 |
| 1.756000000000005 | 0.046 | 0.01 | 0.002 |
| 1.760000000000005 | 0.045 | 0.01 | 0.002 |
| 1.764000000000005 | 0.045 | 0.009 | 0.002 |
| 1.768000000000005 | 0.044 | 0.009 | 0.002 |
| 1.772000000000005 | 0.043 | 0.009 | 0.002 |
| 1.776000000000005 | 0.043 | 0.009 | 0.002 |
| 1.780000000000005 | 0.042 | 0.009 | 0.002 |
| 1.784000000000005 | 0.041 | 0.008 | 0.002 |
| 1.788000000000005 | 0.041 | 0.008 | 0.002 |
| 1.792000000000005 | 0.04 | 0.008 | 0.002 |
| 1.796000000000005 | 0.04 | 0.008 | 0.002 |
| 1.800000000000005 | 0.039 | 0.008 | 0.002 |
| 1.804000000000005 | 0.039 | 0.008 | 0.001 |
| 1.808000000000005 | 0.038 | 0.007 | 0.001 |
| 1.812000000000005 | 0.038 | 0.007 | 0.001 |
| 1.816000000000005 | 0.037 | 0.007 | 0.001 |
| 1.820000000000005 | 0.036 | 0.007 | 0.001 |
| 1.824000000000005 | 0.036 | 0.007 | 0.001 |
| 1.828000000000005 | 0.035 | 0.007 | 0.001 |
| 1.832000000000005 | 0.035 | 0.007 | 0.001 |
| 1.836000000000005 | 0.034 | 0.006 | 0.001 |
| 1.840000000000005 | 0.034 | 0.006 | 0.001 |
| 1.844000000000005 | 0.033 | 0.006 | 0.001 |
| 1.848000000000005 | 0.033 | 0.006 | 0.001 |
| 1.852000000000005 | 0.032 | 0.006 | 0.001 |
| 1.856000000000005 | 0.032 | 0.006 | 0.001 |
| 1.860000000000005 | 0.031 | 0.006 | 0.001 |
| 1.864000000000005 | 0.031 | 0.005 | 0.001 |
| 1.868000000000005 | 0.031 | 0.005 | 0.001 |
| 1.872000000000005 | 0.03 | 0.005 | 0.001 |
| 1.876000000000005 | 0.03 | 0.005 | 0.001 |
| 1.880000000000005 | 0.029 | 0.005 | 0.001 |
| 1.884000000000005 | 0.029 | 0.005 | 0.001 |
| 1.888000000000005 | 0.028 | 0.005 | 0.001 |
| 1.892000000000005 | 0.028 | 0.005 | 0.001 |
| 1.896000000000005 | 0.027 | 0.005 | 0.001 |
| 1.900000000000005 | 0.027 | 0.004 | 0.001 |
| 1.904000000000005 | 0.027 | 0.004 | 0.001 |
| 1.908000000000005 | 0.026 | 0.004 | 0.001 |
| 1.912000000000005 | 0.026 | 0.004 | 0.001 |
| 1.916000000000005 | 0.025 | 0.004 | 0.001 |
| 1.920000000000005 | 0.025 | 0.004 | 0.001 |
| 1.924000000000005 | 0.025 | 0.004 | 0.001 |
| 1.928000000000005 | 0.024 | 0.004 | 0.001 |
| 1.932000000000005 | 0.024 | 0.004 | 0.001 |
| 1.936000000000005 | 0.024 | 0.004 | 0.001 |
| 1.940000000000005 | 0.023 | 0.004 | 0.001 |
| 1.944000000000005 | 0.023 | 0.003 | 0.001 |
| 1.948000000000005 | 0.022 | 0.003 | 0.001 |
| 1.952000000000005 | 0.022 | 0.003 | 0 |
| 1.956000000000005 | 0.022 | 0.003 | 0 |
| 1.960000000000005 | 0.021 | 0.003 | 0 |
| 1.964000000000005 | 0.021 | 0.003 | 0 |
| 1.968000000000005 | 0.021 | 0.003 | 0 |
| 1.972000000000005 | 0.02 | 0.003 | 0 |
| 1.976000000000005 | 0.02 | 0.003 | 0 |
| 1.980000000000005 | 0.02 | 0.003 | 0 |
| 1.984000000000005 | 0.02 | 0.003 | 0 |
| 1.988000000000005 | 0.019 | 0.003 | 0 |
| 1.992000000000005 | 0.019 | 0.003 | 0 |
| 1.996000000000005 | 0.019 | 0.003 | 0 |
| 2.000000000000005 | 0.018 | 0.002 | 0 |
| 2.004000000000005 | 0.018 | 0.002 | 0 |
| 2.008000000000005 | 0.018 | 0.002 | 0 |
| 2.012000000000005 | 0.017 | 0.002 | 0 |
| 2.016000000000005 | 0.017 | 0.002 | 0 |
| 2.020000000000005 | 0.017 | 0.002 | 0 |
| 2.024000000000005 | 0.017 | 0.002 | 0 |
| 2.028000000000005 | 0.016 | 0.002 | 0 |
| 2.032000000000005 | 0.016 | 0.002 | 0 |
| 2.036000000000005 | 0.016 | 0.002 | 0 |
| 2.040000000000005 | 0.016 | 0.002 | 0 |
| 2.044000000000005 | 0.015 | 0.002 | 0 |
| 2.048000000000005 | 0.015 | 0.002 | 0 |
| 2.052000000000005 | 0.015 | 0.002 | 0 |
| 2.056000000000005 | 0.015 | 0.002 | 0 |
| 2.060000000000005 | 0.014 | 0.002 | 0 |
| 2.064000000000005 | 0.014 | 0.002 | 0 |
| 2.068000000000005 | 0.014 | 0.002 | 0 |
| 2.072000000000005 | 0.014 | 0.002 | 0 |
| 2.076000000000005 | 0.013 | 0.002 | 0 |
| 2.080000000000005 | 0.013 | 0.002 | 0 |
| 2.084000000000005 | 0.013 | 0.001 | 0 |
| 2.088000000000005 | 0.013 | 0.001 | 0 |
| 2.092000000000005 | 0.013 | 0.001 | 0 |
| 2.096000000000005 | 0.012 | 0.001 | 0 |
| 2.100000000000005 | 0.012 | 0.001 | 0 |
| 2.104000000000005 | 0.012 | 0.001 | 0 |
| 2.108000000000005 | 0.012 | 0.001 | 0 |
| 2.112000000000005 | 0.012 | 0.001 | 0 |
| 2.116000000000005 | 0.011 | 0.001 | 0 |
| 2.120000000000005 | 0.011 | 0.001 | 0 |
| 2.124000000000005 | 0.011 | 0.001 | 0 |
| 2.128000000000005 | 0.011 | 0.001 | 0 |
| 2.132000000000005 | 0.011 | 0.001 | 0 |
| 2.136000000000005 | 0.01 | 0.001 | 0 |
| 2.140000000000005 | 0.01 | 0.001 | 0 |
| 2.144000000000005 | 0.01 | 0.001 | 0 |
| 2.148000000000005 | 0.01 | 0.001 | 0 |
| 2.152000000000005 | 0.01 | 0.001 | 0 |
| 2.156000000000005 | 0.01 | 0.001 | 0 |
| 2.160000000000005 | 0.009 | 0.001 | 0 |
| 2.164000000000005 | 0.009 | 0.001 | 0 |
| 2.168000000000005 | 0.009 | 0.001 | 0 |
| 2.172000000000005 | 0.009 | 0.001 | 0 |
| 2.176000000000005 | 0.009 | 0.001 | 0 |
| 2.180000000000005 | 0.009 | 0.001 | 0 |
| 2.184000000000005 | 0.008 | 0.001 | 0 |
| 2.188000000000005 | 0.008 | 0.001 | 0 |
| 2.192000000000005 | 0.008 | 0.001 | 0 |
| 2.196000000000005 | 0.008 | 0.001 | 0 |
| 2.200000000000005 | 0.008 | 0.001 | 0 |
| 2.204000000000005 | 0.008 | 0.001 | 0 |
| 2.208000000000005 | 0.008 | 0.001 | 0 |
| 2.212000000000005 | 0.007 | 0.001 | 0 |
| 2.216000000000005 | 0.007 | 0.001 | 0 |
| 2.220000000000005 | 0.007 | 0.001 | 0 |
| 2.224000000000005 | 0.007 | 0.001 | 0 |
| 2.228000000000005 | 0.007 | 0.001 | 0 |
| 2.232000000000005 | 0.007 | 0.001 | 0 |
| 2.236000000000005 | 0.007 | 0.001 | 0 |
| 2.240000000000005 | 0.007 | 0.001 | 0 |
| 2.244000000000005 | 0.007 | 0.001 | 0 |
| 2.248000000000005 | 0.006 | 0.001 | 0 |
| 2.252000000000005 | 0.006 | 0 | 0 |
| 2.256000000000005 | 0.006 | 0 | 0 |
| 2.260000000000005 | 0.006 | 0 | 0 |
| 2.264000000000005 | 0.006 | 0 | 0 |
| 2.268000000000005 | 0.006 | 0 | 0 |
| 2.272000000000005 | 0.006 | 0 | 0 |
| 2.276000000000005 | 0.006 | 0 | 0 |
| 2.280000000000005 | 0.006 | 0 | 0 |
| 2.284000000000005 | 0.005 | 0 | 0 |
| 2.288000000000005 | 0.005 | 0 | 0 |
| 2.292000000000005 | 0.005 | 0 | 0 |
| 2.296000000000005 | 0.005 | 0 | 0 |
| 2.300000000000005 | 0.005 | 0 | 0 |
| 2.304000000000005 | 0.005 | 0 | 0 |
| 2.308000000000005 | 0.005 | 0 | 0 |
| 2.312000000000005 | 0.005 | 0 | 0 |
| 2.316000000000005 | 0.005 | 0 | 0 |
| 2.320000000000005 | 0.005 | 0 | 0 |
| 2.324000000000005 | 0.005 | 0 | 0 |
| 2.328000000000005 | 0.004 | 0 | 0 |
| 2.332000000000005 | 0.004 | 0 | 0 |
| 2.336000000000005 | 0.004 | 0 | 0 |
| 2.340000000000005 | 0.004 | 0 | 0 |
| 2.344000000000005 | 0.004 | 0 | 0 |
| 2.348000000000005 | 0.004 | 0 | 0 |
| 2.352000000000005 | 0.004 | 0 | 0 |
| 2.356000000000005 | 0.004 | 0 | 0 |
| 2.360000000000005 | 0.004 | 0 | 0 |
| 2.364000000000005 | 0.004 | 0 | 0 |
| 2.368000000000005 | 0.004 | 0 | 0 |
| 2.372000000000005 | 0.004 | 0 | 0 |
| 2.376000000000005 | 0.004 | 0 | 0 |
| 2.380000000000005 | 0.003 | 0 | 0 |
| 2.384000000000005 | 0.003 | 0 | 0 |
| 2.388000000000005 | 0.003 | 0 | 0 |
| 2.392000000000005 | 0.003 | 0 | 0 |
| 2.396000000000005 | 0.003 | 0 | 0 |
| 2.400000000000005 | 0.003 | 0 | 0 |
| 2.404000000000005 | 0.003 | 0 | 0 |
| 2.408000000000005 | 0.003 | 0 | 0 |
| 2.412000000000005 | 0.003 | 0 | 0 |
| 2.416000000000005 | 0.003 | 0 | 0 |
| 2.420000000000005 | 0.003 | 0 | 0 |
| 2.424000000000005 | 0.003 | 0 | 0 |
| 2.428000000000005 | 0.003 | 0 | 0 |
| 2.432000000000005 | 0.003 | 0 | 0 |
| 2.436000000000005 | 0.003 | 0 | 0 |
| 2.440000000000005 | 0.003 | 0 | 0 |
| 2.444000000000005 | 0.003 | 0 | 0 |
| 2.448000000000005 | 0.002 | 0 | 0 |
| 2.452000000000005 | 0.002 | 0 | 0 |
| 2.456000000000005 | 0.002 | 0 | 0 |
| 2.460000000000005 | 0.002 | 0 | 0 |
| 2.464000000000005 | 0.002 | 0 | 0 |
| 2.468000000000005 | 0.002 | 0 | 0 |
| 2.472000000000005 | 0.002 | 0 | 0 |
| 2.476000000000005 | 0.002 | 0 | 0 |
| 2.480000000000005 | 0.002 | 0 | 0 |
| 2.484000000000005 | 0.002 | 0 | 0 |
| 2.488000000000005 | 0.002 | 0 | 0 |
| 2.492000000000005 | 0.002 | 0 | 0 |
| 2.496000000000005 | 0.002 | 0 | 0 |
| 2.500000000000005 | 0.002 | 0 | 0 |
| 2.504000000000005 | 0.002 | 0 | 0 |
| 2.508000000000005 | 0.002 | 0 | 0 |
| 2.512000000000005 | 0.002 | 0 | 0 |
| 2.516000000000005 | 0.002 | 0 | 0 |
| 2.520000000000005 | 0.002 | 0 | 0 |
| 2.524000000000005 | 0.002 | 0 | 0 |
| 2.528000000000005 | 0.002 | 0 | 0 |
| 2.532000000000005 | 0.002 | 0 | 0 |
| 2.536000000000005 | 0.002 | 0 | 0 |
| 2.540000000000005 | 0.002 | 0 | 0 |
| 2.544000000000005 | 0.002 | 0 | 0 |
| 2.548000000000005 | 0.002 | 0 | 0 |
| 2.552000000000005 | 0.001 | 0 | 0 |
| 2.556000000000005 | 0.001 | 0 | 0 |
| 2.560000000000005 | 0.001 | 0 | 0 |
| 2.564000000000005 | 0.001 | 0 | 0 |
| 2.568000000000005 | 0.001 | 0 | 0 |
| 2.572000000000005 | 0.001 | 0 | 0 |
| 2.576000000000005 | 0.001 | 0 | 0 |
| 2.580000000000005 | 0.001 | 0 | 0 |
| 2.584000000000005 | 0.001 | 0 | 0 |
| 2.588000000000005 | 0.001 | 0 | 0 |
| 2.592000000000005 | 0.001 | 0 | 0 |
| 2.596000000000005 | 0.001 | 0 | 0 |
| 2.600000000000005 | 0.001 | 0 | 0 |
| 2.604000000000005 | 0.001 | 0 | 0 |
| 2.608000000000005 | 0.001 | 0 | 0 |
| 2.612000000000005 | 0.001 | 0 | 0 |
| 2.616000000000005 | 0.001 | 0 | 0 |
| 2.620000000000005 | 0.001 | 0 | 0 |
| 2.624000000000005 | 0.001 | 0 | 0 |
| 2.628000000000005 | 0.001 | 0 | 0 |
| 2.632000000000005 | 0.001 | 0 | 0 |
| 2.636000000000005 | 0.001 | 0 | 0 |
| 2.640000000000005 | 0.001 | 0 | 0 |
| 2.644000000000005 | 0.001 | 0 | 0 |
| 2.648000000000005 | 0.001 | 0 | 0 |
| 2.652000000000005 | 0.001 | 0 | 0 |
| 2.656000000000005 | 0.001 | 0 | 0 |
| 2.660000000000005 | 0.001 | 0 | 0 |
| 2.664000000000005 | 0.001 | 0 | 0 |
| 2.668000000000005 | 0.001 | 0 | 0 |
| 2.672000000000005 | 0.001 | 0 | 0 |
| 2.676000000000005 | 0.001 | 0 | 0 |
| 2.680000000000005 | 0.001 | 0 | 0 |
| 2.684000000000005 | 0.001 | 0 | 0 |
| 2.688000000000005 | 0.001 | 0 | 0 |
| 2.692000000000005 | 0.001 | 0 | 0 |
| 2.696000000000005 | 0.001 | 0 | 0 |
| 2.700000000000005 | 0.001 | 0 | 0 |
| 2.704000000000005 | 0.001 | 0 | 0 |
| 2.708000000000005 | 0.001 | 0 | 0 |
| 2.712000000000005 | 0.001 | 0 | 0 |
| 2.716000000000005 | 0.001 | 0 | 0 |
| 2.720000000000005 | 0.001 | 0 | 0 |
| 2.724000000000005 | 0.001 | 0 | 0 |
| 2.728000000000005 | 0.001 | 0 | 0 |
| 2.732000000000005 | 0.001 | 0 | 0 |
| 2.736000000000005 | 0.001 | 0 | 0 |
| 2.740000000000005 | 0.001 | 0 | 0 |
| 2.744000000000005 | 0.001 | 0 | 0 |
| 2.748000000000005 | 0.001 | 0 | 0 |
| 2.752000000000005 | 0.001 | 0 | 0 |
| 2.756000000000005 | 0.001 | 0 | 0 |
| 2.760000000000005 | 0 | 0 | 0 |
| 2.764000000000005 | 0 | 0 | 0 |
| 2.768000000000005 | 0 | 0 | 0 |
| 2.772000000000005 | 0 | 0 | 0 |
| 2.776000000000005 | 0 | 0 | 0 |
| 2.780000000000005 | 0 | 0 | 0 |
| 2.784000000000005 | 0 | 0 | 0 |
| 2.788000000000006 | 0 | 0 | 0 |
| 2.792000000000005 | 0 | 0 | 0 |
| 2.796000000000005 | 0 | 0 | 0 |
| 2.800000000000006 | 0 | 0 | 0 |
| 2.804000000000006 | 0 | 0 | 0 |
| 2.808000000000006 | 0 | 0 | 0 |
| 2.812000000000006 | 0 | 0 | 0 |
| 2.816000000000006 | 0 | 0 | 0 |
| 2.820000000000006 | 0 | 0 | 0 |
| 2.824000000000006 | 0 | 0 | 0 |
| 2.828000000000006 | 0 | 0 | 0 |
| 2.832000000000006 | 0 | 0 | 0 |
| 2.836000000000006 | 0 | 0 | 0 |
| 2.840000000000006 | 0 | 0 | 0 |
| 2.844000000000006 | 0 | 0 | 0 |
| 2.848000000000006 | 0 | 0 | 0 |
| 2.852000000000006 | 0 | 0 | 0 |
| 2.856000000000006 | 0 | 0 | 0 |
| 2.860000000000006 | 0 | 0 | 0 |
| 2.864000000000006 | 0 | 0 | 0 |
| 2.868000000000006 | 0 | 0 | 0 |
| 2.872000000000006 | 0 | 0 | 0 |
| 2.876000000000006 | 0 | 0 | 0 |
| 2.880000000000006 | 0 | 0 | 0 |
| 2.884000000000006 | 0 | 0 | 0 |
| 2.888000000000006 | 0 | 0 | 0 |
| 2.892000000000006 | 0 | 0 | 0 |
| 2.896000000000006 | 0 | 0 | 0 |
| 2.900000000000006 | 0 | 0 | 0 |
| 2.904000000000006 | 0 | 0 | 0 |
| 2.908000000000006 | 0 | 0 | 0 |
| 2.912000000000006 | 0 | 0 | 0 |
| 2.916000000000006 | 0 | 0 | 0 |
| 2.920000000000006 | 0 | 0 | 0 |
| 2.924000000000006 | 0 | 0 | 0 |
| 2.928000000000006 | 0 | 0 | 0 |
| 2.932000000000006 | 0 | 0 | 0 |
| 2.936000000000006 | 0 | 0 | 0 |
| 2.940000000000006 | 0 | 0 | 0 |
| 2.944000000000006 | 0 | 0 | 0 |
| 2.948000000000006 | 0 | 0 | 0 |
| 2.952000000000006 | 0 | 0 | 0 |
| 2.956000000000006 | 0 | 0 | 0 |
| 2.960000000000006 | 0 | 0 | 0 |
| 2.964000000000006 | 0 | 0 | 0 |
| 2.968000000000006 | 0 | 0 | 0 |
| 2.972000000000006 | 0 | 0 | 0 |
| 2.976000000000006 | 0 | 0 | 0 |
| 2.980000000000006 | 0 | 0 | 0 |
| 2.984000000000006 | 0 | 0 | 0 |
| 2.988000000000006 | 0 | 0 | 0 |
| 2.992000000000006 | 0 | 0 | 0 |
| 2.996000000000006 | 0 | 0 | 0 |
| 3.000000000000006 | 0 | 0 | 0 |
| 3.004000000000006 | 0 | 0 | 0 |
| 3.008000000000006 | 0 | 0 | 0 |
| 3.012000000000006 | 0 | 0 | 0 |
| 3.016000000000006 | 0 | 0 | 0 |
| 3.020000000000006 | 0 | 0 | 0 |
| 3.024000000000006 | 0 | 0 | 0 |
| 3.028000000000006 | 0 | 0 | 0 |
| 3.032000000000006 | 0 | 0 | 0 |
| 3.036000000000006 | 0 | 0 | 0 |
| 3.040000000000006 | 0 | 0 | 0 |
| 3.044000000000006 | 0 | 0 | 0 |
| 3.048000000000006 | 0 | 0 | 0 |
| 3.052000000000006 | 0 | 0 | 0 |
| 3.056000000000006 | 0 | 0 | 0 |
| 3.060000000000006 | 0 | 0 | 0 |
| 3.064000000000006 | 0 | 0 | 0 |
| 3.068000000000006 | 0 | 0 | 0 |
| 3.072000000000006 | 0 | 0 | 0 |
| 3.076000000000006 | 0 | 0 | 0 |
| 3.080000000000006 | 0 | 0 | 0 |
| 3.084000000000006 | 0 | 0 | 0 |
| 3.088000000000006 | 0 | 0 | 0 |
| 3.092000000000006 | 0 | 0 | 0 |
| 3.096000000000006 | 0 | 0 | 0 |
| 3.100000000000006 | 0 | 0 | 0 |
| 3.104000000000006 | 0 | 0 | 0 |
| 3.108000000000006 | 0 | 0 | 0 |
| 3.112000000000006 | 0 | 0 | 0 |
| 3.116000000000006 | 0 | 0 | 0 |
| 3.120000000000006 | 0 | 0 | 0 |
| 3.124000000000006 | 0 | 0 | 0 |
| 3.128000000000006 | 0 | 0 | 0 |
| 3.132000000000006 | 0 | 0 | 0 |
| 3.136000000000006 | 0 | 0 | 0 |
| 3.140000000000006 | 0 | 0 | 0 |
| 3.144000000000006 | 0 | 0 | 0 |
| 3.148000000000006 | 0 | 0 | 0 |
| 3.152000000000006 | 0 | 0 | 0 |
| 3.156000000000006 | 0 | 0 | 0 |
| 3.160000000000006 | 0 | 0 | 0 |
| 3.164000000000006 | 0 | 0 | 0 |
| 3.168000000000006 | 0 | 0 | 0 |
| 3.172000000000006 | 0 | 0 | 0 |
| 3.176000000000006 | 0 | 0 | 0 |
| 3.180000000000006 | 0 | 0 | 0 |
| 3.184000000000006 | 0 | 0 | 0 |
| 3.188000000000006 | 0 | 0 | 0 |
| 3.192000000000006 | 0 | 0 | 0 |
| 3.196000000000006 | 0 | 0 | 0 |
| 3.200000000000006 | 0 | 0 | 0 |
| 3.204000000000006 | 0 | 0 | 0 |
| 3.208000000000006 | 0 | 0 | 0 |
| 3.212000000000006 | 0 | 0 | 0 |
| 3.216000000000006 | 0 | 0 | 0 |
| 3.220000000000006 | 0 | 0 | 0 |
| 3.224000000000006 | 0 | 0 | 0 |
| 3.228000000000006 | 0 | 0 | 0 |
| 3.232000000000006 | 0 | 0 | 0 |
| 3.236000000000006 | 0 | 0 | 0 |
| 3.240000000000006 | 0 | 0 | 0 |
| 3.244000000000006 | 0 | 0 | 0 |
| 3.248000000000006 | 0 | 0 | 0 |
| 3.252000000000006 | 0 | 0 | 0 |
| 3.256000000000006 | 0 | 0 | 0 |
| 3.260000000000006 | 0 | 0 | 0 |
| 3.264000000000006 | 0 | 0 | 0 |
| 3.268000000000006 | 0 | 0 | 0 |
| 3.272000000000006 | 0 | 0 | 0 |
| 3.276000000000006 | 0 | 0 | 0 |
| 3.280000000000006 | 0 | 0 | 0 |
| 3.284000000000006 | 0 | 0 | 0 |
| 3.288000000000006 | 0 | 0 | 0 |
| 3.292000000000006 | 0 | 0 | 0 |
| 3.296000000000006 | 0 | 0 | 0 |
| 3.300000000000006 | 0 | 0 | 0 |
| 3.304000000000006 | 0 | 0 | 0 |
| 3.308000000000006 | 0 | 0 | 0 |
| 3.312000000000006 | 0 | 0 | 0 |
| 3.316000000000006 | 0 | 0 | 0 |
| 3.320000000000006 | 0 | 0 | 0 |
| 3.324000000000006 | 0 | 0 | 0 |
| 3.328000000000006 | 0 | 0 | 0 |
| 3.332000000000006 | 0 | 0 | 0 |
| 3.336000000000006 | 0 | 0 | 0 |
| 3.340000000000006 | 0 | 0 | 0 |
| 3.344000000000006 | 0 | 0 | 0 |
| 3.348000000000006 | 0 | 0 | 0 |
| 3.352000000000006 | 0 | 0 | 0 |
| 3.356000000000006 | 0 | 0 | 0 |
| 3.360000000000006 | 0 | 0 | 0 |
| 3.364000000000006 | 0 | 0 | 0 |
| 3.368000000000006 | 0 | 0 | 0 |
| 3.372000000000006 | 0 | 0 | 0 |
| 3.376000000000006 | 0 | 0 | 0 |
| 3.380000000000006 | 0 | 0 | 0 |
| 3.384000000000006 | 0 | 0 | 0 |
| 3.388000000000006 | 0 | 0 | 0 |
| 3.392000000000006 | 0 | 0 | 0 |
| 3.396000000000006 | 0 | 0 | 0 |
| 3.400000000000006 | 0 | 0 | 0 |
| 3.404000000000006 | 0 | 0 | 0 |
| 3.408000000000006 | 0 | 0 | 0 |
| 3.412000000000006 | 0 | 0 | 0 |
| 3.416000000000006 | 0 | 0 | 0 |
| 3.420000000000006 | 0 | 0 | 0 |
| 3.424000000000006 | 0 | 0 | 0 |
| 3.428000000000006 | 0 | 0 | 0 |
| 3.432000000000006 | 0 | 0 | 0 |
| 3.436000000000006 | 0 | 0 | 0 |
| 3.440000000000006 | 0 | 0 | 0 |
| 3.444000000000006 | 0 | 0 | 0 |
| 3.448000000000006 | 0 | 0 | 0 |
| 3.452000000000006 | 0 | 0 | 0 |
| 3.456000000000006 | 0 | 0 | 0 |
| 3.460000000000006 | 0 | 0 | 0 |
| 3.464000000000006 | 0 | 0 | 0 |
| 3.468000000000006 | 0 | 0 | 0 |
| 3.472000000000006 | 0 | 0 | 0 |
| 3.476000000000006 | 0 | 0 | 0 |
| 3.480000000000006 | 0 | 0 | 0 |
| 3.484000000000006 | 0 | 0 | 0 |
| 3.488000000000006 | 0 | 0 | 0 |
| 3.492000000000006 | 0 | 0 | 0 |
| 3.496000000000006 | 0 | 0 | 0 |
| 3.500000000000006 | 0 | 0 | 0 |
| 3.504000000000006 | 0 | 0 | 0 |
| 3.508000000000006 | 0 | 0 | 0 |
| 3.512000000000006 | 0 | 0 | 0 |
| 3.516000000000006 | 0 | 0 | 0 |
| 3.520000000000006 | 0 | 0 | 0 |
| 3.524000000000006 | 0 | 0 | 0 |
| 3.528000000000006 | 0 | 0 | 0 |
| 3.532000000000006 | 0 | 0 | 0 |
| 3.536000000000006 | 0 | 0 | 0 |
| 3.540000000000006 | 0 | 0 | 0 |
| 3.544000000000006 | 0 | 0 | 0 |
| 3.548000000000006 | 0 | 0 | 0 |
| 3.552000000000006 | 0 | 0 | 0 |
| 3.556000000000006 | 0 | 0 | 0 |
| 3.560000000000006 | 0 | 0 | 0 |
| 3.564000000000006 | 0 | 0 | 0 |
| 3.568000000000006 | 0 | 0 | 0 |
| 3.572000000000006 | 0 | 0 | 0 |
| 3.576000000000006 | 0 | 0 | 0 |
| 3.580000000000006 | 0 | 0 | 0 |
| 3.584000000000006 | 0 | 0 | 0 |
| 3.588000000000006 | 0 | 0 | 0 |
| 3.592000000000006 | 0 | 0 | 0 |
| 3.596000000000006 | 0 | 0 | 0 |
| 3.600000000000006 | 0 | 0 | 0 |
| 3.604000000000006 | 0 | 0 | 0 |
| 3.608000000000006 | 0 | 0 | 0 |
| 3.612000000000006 | 0 | 0 | 0 |
| 3.616000000000006 | 0 | 0 | 0 |
| 3.620000000000006 | 0 | 0 | 0 |
| 3.624000000000006 | 0 | 0 | 0 |
| 3.628000000000006 | 0 | 0 | 0 |
| 3.632000000000006 | 0 | 0 | 0 |
| 3.636000000000006 | 0 | 0 | 0 |
| 3.640000000000006 | 0 | 0 | 0 |
| 3.644000000000006 | 0 | 0 | 0 |
| 3.648000000000006 | 0 | 0 | 0 |
| 3.652000000000006 | 0 | 0 | 0 |
| 3.656000000000006 | 0 | 0 | 0 |
| 3.660000000000006 | 0 | 0 | 0 |
| 3.664000000000006 | 0 | 0 | 0 |
| 3.668000000000006 | 0 | 0 | 0 |
| 3.672000000000006 | 0 | 0 | 0 |
| 3.676000000000006 | 0 | 0 | 0 |
| 3.680000000000006 | 0 | 0 | 0 |
| 3.684000000000006 | 0 | 0 | 0 |
| 3.688000000000006 | 0 | 0 | 0 |
| 3.692000000000006 | 0 | 0 | 0 |
| 3.696000000000006 | 0 | 0 | 0 |
| 3.700000000000006 | 0 | 0 | 0 |
| 3.704000000000006 | 0 | 0 | 0 |
| 3.708000000000006 | 0 | 0 | 0 |
| 3.712000000000006 | 0 | 0 | 0 |
| 3.716000000000006 | 0 | 0 | 0 |
| 3.720000000000006 | 0 | 0 | 0 |
| 3.724000000000006 | 0 | 0 | 0 |
| 3.728000000000006 | 0 | 0 | 0 |
| 3.732000000000006 | 0 | 0 | 0 |
| 3.736000000000006 | 0 | 0 | 0 |
| 3.740000000000006 | 0 | 0 | 0 |
| 3.744000000000006 | 0 | 0 | 0 |
| 3.748000000000006 | 0 | 0 | 0 |
| 3.752000000000006 | 0 | 0 | 0 |
| 3.756000000000006 | 0 | 0 | 0 |
| 3.760000000000006 | 0 | 0 | 0 |
| 3.764000000000006 | 0 | 0 | 0 |
| 3.768000000000006 | 0 | 0 | 0 |
| 3.772000000000006 | 0 | 0 | 0 |
| 3.776000000000006 | 0 | 0 | 0 |
| 3.780000000000006 | 0 | 0 | 0 |
| 3.784000000000006 | 0 | 0 | 0 |
| 3.788000000000006 | 0 | 0 | 0 |
| 3.792000000000006 | 0 | 0 | 0 |
| 3.796000000000006 | 0 | 0 | 0 |
| 3.800000000000006 | 0 | 0 | 0 |
| 3.804000000000006 | 0 | 0 | 0 |
| 3.808000000000006 | 0 | 0 | 0 |
| 3.812000000000006 | 0 | 0 | 0 |
| 3.816000000000006 | 0 | 0 | 0 |
| 3.820000000000006 | 0 | 0 | 0 |
| 3.824000000000006 | 0 | 0 | 0 |
| 3.828000000000006 | 0 | 0 | 0 |
| 3.832000000000006 | 0 | 0 | 0 |
| 3.836000000000006 | 0 | 0 | 0 |
| 3.840000000000006 | 0 | 0 | 0 |
| 3.844000000000006 | 0 | 0 | 0 |
| 3.848000000000006 | 0 | 0 | 0 |
| 3.852000000000006 | 0 | 0 | 0 |
| 3.856000000000006 | 0 | 0 | 0 |
| 3.860000000000006 | 0 | 0 | 0 |
| 3.864000000000006 | 0 | 0 | 0 |
| 3.868000000000006 | 0 | 0 | 0 |
| 3.872000000000006 | 0 | 0 | 0 |
| 3.876000000000006 | 0 | 0 | 0 |
| 3.880000000000006 | 0 | 0 | 0 |
| 3.884000000000006 | 0 | 0 | 0 |
| 3.888000000000007 | 0 | 0 | 0 |
| 3.892000000000006 | 0 | 0 | 0 |
| 3.896000000000006 | 0 | 0 | 0 |
| 3.900000000000007 | 0 | 0 | 0 |
| 3.904000000000007 | 0 | 0 | 0 |
| 3.908000000000007 | 0 | 0 | 0 |
| 3.912000000000007 | 0 | 0 | 0 |
| 3.916000000000007 | 0 | 0 | 0 |
| 3.920000000000007 | 0 | 0 | 0 |
| 3.924000000000007 | 0 | 0 | 0 |
| 3.928000000000007 | 0 | 0 | 0 |
| 3.932000000000007 | 0 | 0 | 0 |
| 3.936000000000007 | 0 | 0 | 0 |
| 3.940000000000007 | 0 | 0 | 0 |
| 3.944000000000007 | 0 | 0 | 0 |
| 3.948000000000007 | 0 | 0 | 0 |
| 3.952000000000007 | 0 | 0 | 0 |
| 3.956000000000007 | 0 | 0 | 0 |
| 3.960000000000007 | 0 | 0 | 0 |
| 3.964000000000007 | 0 | 0 | 0 |
| 3.968000000000007 | 0 | 0 | 0 |
| 3.972000000000007 | 0 | 0 | 0 |
| 3.976000000000007 | 0 | 0 | 0 |
| 3.980000000000007 | 0 | 0 | 0 |
| 3.984000000000007 | 0 | 0 | 0 |
| 3.988000000000007 | 0 | 0 | 0 |
| 3.992000000000007 | 0 | 0 | 0 |
| 3.996000000000007 | 0 | 0 | 0 |
| 4.000000000000006 | 0 | 0 | 0 |